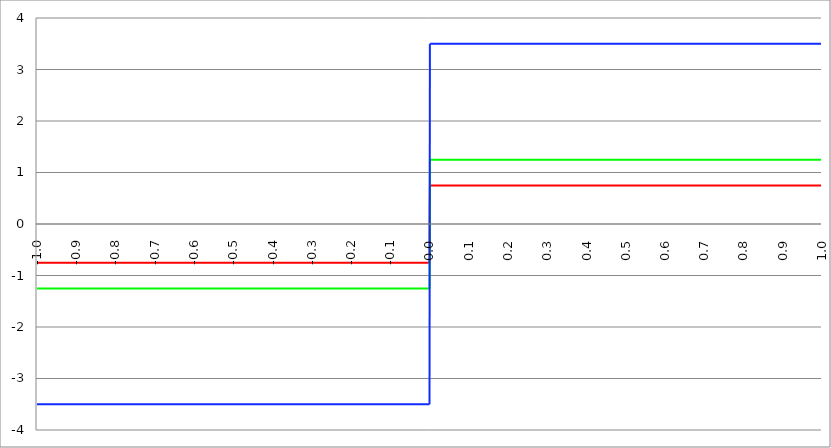
| Category | Series 1 | Series 0 | Series 2 |
|---|---|---|---|
| -1.0 | -0.75 | -1.25 | -3.5 |
| -0.999 | -0.75 | -1.25 | -3.5 |
| -0.998 | -0.75 | -1.25 | -3.5 |
| -0.997 | -0.75 | -1.25 | -3.5 |
| -0.996 | -0.75 | -1.25 | -3.5 |
| -0.995 | -0.75 | -1.25 | -3.5 |
| -0.994 | -0.75 | -1.25 | -3.5 |
| -0.993 | -0.75 | -1.25 | -3.5 |
| -0.992 | -0.75 | -1.25 | -3.5 |
| -0.991 | -0.75 | -1.25 | -3.5 |
| -0.99 | -0.75 | -1.25 | -3.5 |
| -0.989 | -0.75 | -1.25 | -3.5 |
| -0.988 | -0.75 | -1.25 | -3.5 |
| -0.987 | -0.75 | -1.25 | -3.5 |
| -0.986 | -0.75 | -1.25 | -3.5 |
| -0.985 | -0.75 | -1.25 | -3.5 |
| -0.984 | -0.75 | -1.25 | -3.5 |
| -0.983 | -0.75 | -1.25 | -3.5 |
| -0.982 | -0.75 | -1.25 | -3.5 |
| -0.981 | -0.75 | -1.25 | -3.5 |
| -0.98 | -0.75 | -1.25 | -3.5 |
| -0.979 | -0.75 | -1.25 | -3.5 |
| -0.978 | -0.75 | -1.25 | -3.5 |
| -0.977 | -0.75 | -1.25 | -3.5 |
| -0.976 | -0.75 | -1.25 | -3.5 |
| -0.975 | -0.75 | -1.25 | -3.5 |
| -0.974 | -0.75 | -1.25 | -3.5 |
| -0.973 | -0.75 | -1.25 | -3.5 |
| -0.972 | -0.75 | -1.25 | -3.5 |
| -0.971 | -0.75 | -1.25 | -3.5 |
| -0.97 | -0.75 | -1.25 | -3.5 |
| -0.969 | -0.75 | -1.25 | -3.5 |
| -0.968 | -0.75 | -1.25 | -3.5 |
| -0.967 | -0.75 | -1.25 | -3.5 |
| -0.966 | -0.75 | -1.25 | -3.5 |
| -0.965 | -0.75 | -1.25 | -3.5 |
| -0.964 | -0.75 | -1.25 | -3.5 |
| -0.963 | -0.75 | -1.25 | -3.5 |
| -0.962 | -0.75 | -1.25 | -3.5 |
| -0.961 | -0.75 | -1.25 | -3.5 |
| -0.96 | -0.75 | -1.25 | -3.5 |
| -0.959 | -0.75 | -1.25 | -3.5 |
| -0.958 | -0.75 | -1.25 | -3.5 |
| -0.957 | -0.75 | -1.25 | -3.5 |
| -0.956 | -0.75 | -1.25 | -3.5 |
| -0.955 | -0.75 | -1.25 | -3.5 |
| -0.954 | -0.75 | -1.25 | -3.5 |
| -0.953 | -0.75 | -1.25 | -3.5 |
| -0.952 | -0.75 | -1.25 | -3.5 |
| -0.951 | -0.75 | -1.25 | -3.5 |
| -0.95 | -0.75 | -1.25 | -3.5 |
| -0.949 | -0.75 | -1.25 | -3.5 |
| -0.948 | -0.75 | -1.25 | -3.5 |
| -0.947 | -0.75 | -1.25 | -3.5 |
| -0.946 | -0.75 | -1.25 | -3.5 |
| -0.945 | -0.75 | -1.25 | -3.5 |
| -0.944 | -0.75 | -1.25 | -3.5 |
| -0.943 | -0.75 | -1.25 | -3.5 |
| -0.942 | -0.75 | -1.25 | -3.5 |
| -0.941 | -0.75 | -1.25 | -3.5 |
| -0.94 | -0.75 | -1.25 | -3.5 |
| -0.939 | -0.75 | -1.25 | -3.5 |
| -0.938 | -0.75 | -1.25 | -3.5 |
| -0.937 | -0.75 | -1.25 | -3.5 |
| -0.936 | -0.75 | -1.25 | -3.5 |
| -0.935 | -0.75 | -1.25 | -3.5 |
| -0.934 | -0.75 | -1.25 | -3.5 |
| -0.933 | -0.75 | -1.25 | -3.5 |
| -0.932 | -0.75 | -1.25 | -3.5 |
| -0.931 | -0.75 | -1.25 | -3.5 |
| -0.93 | -0.75 | -1.25 | -3.5 |
| -0.929 | -0.75 | -1.25 | -3.5 |
| -0.928 | -0.75 | -1.25 | -3.5 |
| -0.927 | -0.75 | -1.25 | -3.5 |
| -0.926 | -0.75 | -1.25 | -3.5 |
| -0.925 | -0.75 | -1.25 | -3.5 |
| -0.924 | -0.75 | -1.25 | -3.5 |
| -0.923 | -0.75 | -1.25 | -3.5 |
| -0.922 | -0.75 | -1.25 | -3.5 |
| -0.921 | -0.75 | -1.25 | -3.5 |
| -0.92 | -0.75 | -1.25 | -3.5 |
| -0.919 | -0.75 | -1.25 | -3.5 |
| -0.918 | -0.75 | -1.25 | -3.5 |
| -0.917 | -0.75 | -1.25 | -3.5 |
| -0.916 | -0.75 | -1.25 | -3.5 |
| -0.915 | -0.75 | -1.25 | -3.5 |
| -0.914 | -0.75 | -1.25 | -3.5 |
| -0.913 | -0.75 | -1.25 | -3.5 |
| -0.912 | -0.75 | -1.25 | -3.5 |
| -0.911 | -0.75 | -1.25 | -3.5 |
| -0.91 | -0.75 | -1.25 | -3.5 |
| -0.909 | -0.75 | -1.25 | -3.5 |
| -0.908 | -0.75 | -1.25 | -3.5 |
| -0.907 | -0.75 | -1.25 | -3.5 |
| -0.906 | -0.75 | -1.25 | -3.5 |
| -0.905 | -0.75 | -1.25 | -3.5 |
| -0.904 | -0.75 | -1.25 | -3.5 |
| -0.903 | -0.75 | -1.25 | -3.5 |
| -0.902 | -0.75 | -1.25 | -3.5 |
| -0.901 | -0.75 | -1.25 | -3.5 |
| -0.9 | -0.75 | -1.25 | -3.5 |
| -0.899 | -0.75 | -1.25 | -3.5 |
| -0.898 | -0.75 | -1.25 | -3.5 |
| -0.897 | -0.75 | -1.25 | -3.5 |
| -0.896 | -0.75 | -1.25 | -3.5 |
| -0.895 | -0.75 | -1.25 | -3.5 |
| -0.894 | -0.75 | -1.25 | -3.5 |
| -0.893 | -0.75 | -1.25 | -3.5 |
| -0.892 | -0.75 | -1.25 | -3.5 |
| -0.891 | -0.75 | -1.25 | -3.5 |
| -0.89 | -0.75 | -1.25 | -3.5 |
| -0.889 | -0.75 | -1.25 | -3.5 |
| -0.888 | -0.75 | -1.25 | -3.5 |
| -0.887 | -0.75 | -1.25 | -3.5 |
| -0.886 | -0.75 | -1.25 | -3.5 |
| -0.885 | -0.75 | -1.25 | -3.5 |
| -0.884 | -0.75 | -1.25 | -3.5 |
| -0.883 | -0.75 | -1.25 | -3.5 |
| -0.882 | -0.75 | -1.25 | -3.5 |
| -0.881 | -0.75 | -1.25 | -3.5 |
| -0.88 | -0.75 | -1.25 | -3.5 |
| -0.879 | -0.75 | -1.25 | -3.5 |
| -0.878 | -0.75 | -1.25 | -3.5 |
| -0.877 | -0.75 | -1.25 | -3.5 |
| -0.876 | -0.75 | -1.25 | -3.5 |
| -0.875 | -0.75 | -1.25 | -3.5 |
| -0.874 | -0.75 | -1.25 | -3.5 |
| -0.873 | -0.75 | -1.25 | -3.5 |
| -0.872 | -0.75 | -1.25 | -3.5 |
| -0.871 | -0.75 | -1.25 | -3.5 |
| -0.87 | -0.75 | -1.25 | -3.5 |
| -0.869 | -0.75 | -1.25 | -3.5 |
| -0.868 | -0.75 | -1.25 | -3.5 |
| -0.867 | -0.75 | -1.25 | -3.5 |
| -0.866 | -0.75 | -1.25 | -3.5 |
| -0.865 | -0.75 | -1.25 | -3.5 |
| -0.864 | -0.75 | -1.25 | -3.5 |
| -0.863 | -0.75 | -1.25 | -3.5 |
| -0.862 | -0.75 | -1.25 | -3.5 |
| -0.861 | -0.75 | -1.25 | -3.5 |
| -0.86 | -0.75 | -1.25 | -3.5 |
| -0.859 | -0.75 | -1.25 | -3.5 |
| -0.858 | -0.75 | -1.25 | -3.5 |
| -0.857 | -0.75 | -1.25 | -3.5 |
| -0.856 | -0.75 | -1.25 | -3.5 |
| -0.855 | -0.75 | -1.25 | -3.5 |
| -0.854 | -0.75 | -1.25 | -3.5 |
| -0.853 | -0.75 | -1.25 | -3.5 |
| -0.852 | -0.75 | -1.25 | -3.5 |
| -0.851 | -0.75 | -1.25 | -3.5 |
| -0.85 | -0.75 | -1.25 | -3.5 |
| -0.849 | -0.75 | -1.25 | -3.5 |
| -0.848 | -0.75 | -1.25 | -3.5 |
| -0.847 | -0.75 | -1.25 | -3.5 |
| -0.846 | -0.75 | -1.25 | -3.5 |
| -0.845 | -0.75 | -1.25 | -3.5 |
| -0.844 | -0.75 | -1.25 | -3.5 |
| -0.843 | -0.75 | -1.25 | -3.5 |
| -0.842 | -0.75 | -1.25 | -3.5 |
| -0.841 | -0.75 | -1.25 | -3.5 |
| -0.84 | -0.75 | -1.25 | -3.5 |
| -0.839 | -0.75 | -1.25 | -3.5 |
| -0.838 | -0.75 | -1.25 | -3.5 |
| -0.837 | -0.75 | -1.25 | -3.5 |
| -0.836 | -0.75 | -1.25 | -3.5 |
| -0.835 | -0.75 | -1.25 | -3.5 |
| -0.834 | -0.75 | -1.25 | -3.5 |
| -0.833 | -0.75 | -1.25 | -3.5 |
| -0.832 | -0.75 | -1.25 | -3.5 |
| -0.831 | -0.75 | -1.25 | -3.5 |
| -0.83 | -0.75 | -1.25 | -3.5 |
| -0.829 | -0.75 | -1.25 | -3.5 |
| -0.828 | -0.75 | -1.25 | -3.5 |
| -0.827 | -0.75 | -1.25 | -3.5 |
| -0.826 | -0.75 | -1.25 | -3.5 |
| -0.825 | -0.75 | -1.25 | -3.5 |
| -0.824 | -0.75 | -1.25 | -3.5 |
| -0.823 | -0.75 | -1.25 | -3.5 |
| -0.822 | -0.75 | -1.25 | -3.5 |
| -0.821 | -0.75 | -1.25 | -3.5 |
| -0.82 | -0.75 | -1.25 | -3.5 |
| -0.819 | -0.75 | -1.25 | -3.5 |
| -0.818 | -0.75 | -1.25 | -3.5 |
| -0.817 | -0.75 | -1.25 | -3.5 |
| -0.816 | -0.75 | -1.25 | -3.5 |
| -0.815 | -0.75 | -1.25 | -3.5 |
| -0.814 | -0.75 | -1.25 | -3.5 |
| -0.813 | -0.75 | -1.25 | -3.5 |
| -0.812 | -0.75 | -1.25 | -3.5 |
| -0.811 | -0.75 | -1.25 | -3.5 |
| -0.81 | -0.75 | -1.25 | -3.5 |
| -0.809 | -0.75 | -1.25 | -3.5 |
| -0.808 | -0.75 | -1.25 | -3.5 |
| -0.807 | -0.75 | -1.25 | -3.5 |
| -0.806 | -0.75 | -1.25 | -3.5 |
| -0.805 | -0.75 | -1.25 | -3.5 |
| -0.804 | -0.75 | -1.25 | -3.5 |
| -0.803 | -0.75 | -1.25 | -3.5 |
| -0.802 | -0.75 | -1.25 | -3.5 |
| -0.801 | -0.75 | -1.25 | -3.5 |
| -0.8 | -0.75 | -1.25 | -3.5 |
| -0.799 | -0.75 | -1.25 | -3.5 |
| -0.798 | -0.75 | -1.25 | -3.5 |
| -0.797 | -0.75 | -1.25 | -3.5 |
| -0.796 | -0.75 | -1.25 | -3.5 |
| -0.795 | -0.75 | -1.25 | -3.5 |
| -0.794 | -0.75 | -1.25 | -3.5 |
| -0.793 | -0.75 | -1.25 | -3.5 |
| -0.792 | -0.75 | -1.25 | -3.5 |
| -0.791 | -0.75 | -1.25 | -3.5 |
| -0.79 | -0.75 | -1.25 | -3.5 |
| -0.789 | -0.75 | -1.25 | -3.5 |
| -0.788 | -0.75 | -1.25 | -3.5 |
| -0.787 | -0.75 | -1.25 | -3.5 |
| -0.786 | -0.75 | -1.25 | -3.5 |
| -0.785 | -0.75 | -1.25 | -3.5 |
| -0.784 | -0.75 | -1.25 | -3.5 |
| -0.783 | -0.75 | -1.25 | -3.5 |
| -0.782 | -0.75 | -1.25 | -3.5 |
| -0.781 | -0.75 | -1.25 | -3.5 |
| -0.78 | -0.75 | -1.25 | -3.5 |
| -0.779 | -0.75 | -1.25 | -3.5 |
| -0.778 | -0.75 | -1.25 | -3.5 |
| -0.777 | -0.75 | -1.25 | -3.5 |
| -0.776 | -0.75 | -1.25 | -3.5 |
| -0.775 | -0.75 | -1.25 | -3.5 |
| -0.774 | -0.75 | -1.25 | -3.5 |
| -0.773 | -0.75 | -1.25 | -3.5 |
| -0.772 | -0.75 | -1.25 | -3.5 |
| -0.771 | -0.75 | -1.25 | -3.5 |
| -0.77 | -0.75 | -1.25 | -3.5 |
| -0.769 | -0.75 | -1.25 | -3.5 |
| -0.768 | -0.75 | -1.25 | -3.5 |
| -0.767 | -0.75 | -1.25 | -3.5 |
| -0.766 | -0.75 | -1.25 | -3.5 |
| -0.765 | -0.75 | -1.25 | -3.5 |
| -0.764 | -0.75 | -1.25 | -3.5 |
| -0.763 | -0.75 | -1.25 | -3.5 |
| -0.762 | -0.75 | -1.25 | -3.5 |
| -0.761 | -0.75 | -1.25 | -3.5 |
| -0.76 | -0.75 | -1.25 | -3.5 |
| -0.759 | -0.75 | -1.25 | -3.5 |
| -0.758 | -0.75 | -1.25 | -3.5 |
| -0.757 | -0.75 | -1.25 | -3.5 |
| -0.756 | -0.75 | -1.25 | -3.5 |
| -0.755 | -0.75 | -1.25 | -3.5 |
| -0.754 | -0.75 | -1.25 | -3.5 |
| -0.753 | -0.75 | -1.25 | -3.5 |
| -0.752 | -0.75 | -1.25 | -3.5 |
| -0.751 | -0.75 | -1.25 | -3.5 |
| -0.75 | -0.75 | -1.25 | -3.5 |
| -0.749 | -0.75 | -1.25 | -3.5 |
| -0.748 | -0.75 | -1.25 | -3.5 |
| -0.747 | -0.75 | -1.25 | -3.5 |
| -0.746 | -0.75 | -1.25 | -3.5 |
| -0.745 | -0.75 | -1.25 | -3.5 |
| -0.744 | -0.75 | -1.25 | -3.5 |
| -0.743 | -0.75 | -1.25 | -3.5 |
| -0.742 | -0.75 | -1.25 | -3.5 |
| -0.741 | -0.75 | -1.25 | -3.5 |
| -0.74 | -0.75 | -1.25 | -3.5 |
| -0.739 | -0.75 | -1.25 | -3.5 |
| -0.738 | -0.75 | -1.25 | -3.5 |
| -0.737 | -0.75 | -1.25 | -3.5 |
| -0.736 | -0.75 | -1.25 | -3.5 |
| -0.735 | -0.75 | -1.25 | -3.5 |
| -0.734 | -0.75 | -1.25 | -3.5 |
| -0.733 | -0.75 | -1.25 | -3.5 |
| -0.732 | -0.75 | -1.25 | -3.5 |
| -0.731 | -0.75 | -1.25 | -3.5 |
| -0.73 | -0.75 | -1.25 | -3.5 |
| -0.729 | -0.75 | -1.25 | -3.5 |
| -0.728 | -0.75 | -1.25 | -3.5 |
| -0.727 | -0.75 | -1.25 | -3.5 |
| -0.726 | -0.75 | -1.25 | -3.5 |
| -0.725 | -0.75 | -1.25 | -3.5 |
| -0.724 | -0.75 | -1.25 | -3.5 |
| -0.723 | -0.75 | -1.25 | -3.5 |
| -0.722 | -0.75 | -1.25 | -3.5 |
| -0.721 | -0.75 | -1.25 | -3.5 |
| -0.72 | -0.75 | -1.25 | -3.5 |
| -0.719 | -0.75 | -1.25 | -3.5 |
| -0.718 | -0.75 | -1.25 | -3.5 |
| -0.717 | -0.75 | -1.25 | -3.5 |
| -0.716 | -0.75 | -1.25 | -3.5 |
| -0.715 | -0.75 | -1.25 | -3.5 |
| -0.714 | -0.75 | -1.25 | -3.5 |
| -0.713 | -0.75 | -1.25 | -3.5 |
| -0.712 | -0.75 | -1.25 | -3.5 |
| -0.711 | -0.75 | -1.25 | -3.5 |
| -0.71 | -0.75 | -1.25 | -3.5 |
| -0.709 | -0.75 | -1.25 | -3.5 |
| -0.708 | -0.75 | -1.25 | -3.5 |
| -0.707 | -0.75 | -1.25 | -3.5 |
| -0.706 | -0.75 | -1.25 | -3.5 |
| -0.705 | -0.75 | -1.25 | -3.5 |
| -0.704 | -0.75 | -1.25 | -3.5 |
| -0.703 | -0.75 | -1.25 | -3.5 |
| -0.702 | -0.75 | -1.25 | -3.5 |
| -0.701 | -0.75 | -1.25 | -3.5 |
| -0.7 | -0.75 | -1.25 | -3.5 |
| -0.699 | -0.75 | -1.25 | -3.5 |
| -0.698 | -0.75 | -1.25 | -3.5 |
| -0.697 | -0.75 | -1.25 | -3.5 |
| -0.696 | -0.75 | -1.25 | -3.5 |
| -0.695 | -0.75 | -1.25 | -3.5 |
| -0.694 | -0.75 | -1.25 | -3.5 |
| -0.693 | -0.75 | -1.25 | -3.5 |
| -0.692 | -0.75 | -1.25 | -3.5 |
| -0.691 | -0.75 | -1.25 | -3.5 |
| -0.69 | -0.75 | -1.25 | -3.5 |
| -0.689 | -0.75 | -1.25 | -3.5 |
| -0.688 | -0.75 | -1.25 | -3.5 |
| -0.687 | -0.75 | -1.25 | -3.5 |
| -0.686 | -0.75 | -1.25 | -3.5 |
| -0.685 | -0.75 | -1.25 | -3.5 |
| -0.684 | -0.75 | -1.25 | -3.5 |
| -0.683 | -0.75 | -1.25 | -3.5 |
| -0.682 | -0.75 | -1.25 | -3.5 |
| -0.681 | -0.75 | -1.25 | -3.5 |
| -0.68 | -0.75 | -1.25 | -3.5 |
| -0.679 | -0.75 | -1.25 | -3.5 |
| -0.678 | -0.75 | -1.25 | -3.5 |
| -0.677 | -0.75 | -1.25 | -3.5 |
| -0.676 | -0.75 | -1.25 | -3.5 |
| -0.675 | -0.75 | -1.25 | -3.5 |
| -0.674 | -0.75 | -1.25 | -3.5 |
| -0.673 | -0.75 | -1.25 | -3.5 |
| -0.672 | -0.75 | -1.25 | -3.5 |
| -0.671 | -0.75 | -1.25 | -3.5 |
| -0.67 | -0.75 | -1.25 | -3.5 |
| -0.669 | -0.75 | -1.25 | -3.5 |
| -0.668 | -0.75 | -1.25 | -3.5 |
| -0.667 | -0.75 | -1.25 | -3.5 |
| -0.666 | -0.75 | -1.25 | -3.5 |
| -0.665 | -0.75 | -1.25 | -3.5 |
| -0.664 | -0.75 | -1.25 | -3.5 |
| -0.663 | -0.75 | -1.25 | -3.5 |
| -0.662 | -0.75 | -1.25 | -3.5 |
| -0.661 | -0.75 | -1.25 | -3.5 |
| -0.66 | -0.75 | -1.25 | -3.5 |
| -0.659 | -0.75 | -1.25 | -3.5 |
| -0.658 | -0.75 | -1.25 | -3.5 |
| -0.657 | -0.75 | -1.25 | -3.5 |
| -0.656 | -0.75 | -1.25 | -3.5 |
| -0.655 | -0.75 | -1.25 | -3.5 |
| -0.654 | -0.75 | -1.25 | -3.5 |
| -0.653 | -0.75 | -1.25 | -3.5 |
| -0.652 | -0.75 | -1.25 | -3.5 |
| -0.651 | -0.75 | -1.25 | -3.5 |
| -0.65 | -0.75 | -1.25 | -3.5 |
| -0.649 | -0.75 | -1.25 | -3.5 |
| -0.648 | -0.75 | -1.25 | -3.5 |
| -0.647 | -0.75 | -1.25 | -3.5 |
| -0.646 | -0.75 | -1.25 | -3.5 |
| -0.645 | -0.75 | -1.25 | -3.5 |
| -0.644 | -0.75 | -1.25 | -3.5 |
| -0.643 | -0.75 | -1.25 | -3.5 |
| -0.642 | -0.75 | -1.25 | -3.5 |
| -0.641 | -0.75 | -1.25 | -3.5 |
| -0.64 | -0.75 | -1.25 | -3.5 |
| -0.639 | -0.75 | -1.25 | -3.5 |
| -0.638 | -0.75 | -1.25 | -3.5 |
| -0.637 | -0.75 | -1.25 | -3.5 |
| -0.636 | -0.75 | -1.25 | -3.5 |
| -0.635 | -0.75 | -1.25 | -3.5 |
| -0.634 | -0.75 | -1.25 | -3.5 |
| -0.633 | -0.75 | -1.25 | -3.5 |
| -0.632 | -0.75 | -1.25 | -3.5 |
| -0.631 | -0.75 | -1.25 | -3.5 |
| -0.63 | -0.75 | -1.25 | -3.5 |
| -0.629 | -0.75 | -1.25 | -3.5 |
| -0.628 | -0.75 | -1.25 | -3.5 |
| -0.627 | -0.75 | -1.25 | -3.5 |
| -0.626 | -0.75 | -1.25 | -3.5 |
| -0.625 | -0.75 | -1.25 | -3.5 |
| -0.624 | -0.75 | -1.25 | -3.5 |
| -0.623 | -0.75 | -1.25 | -3.5 |
| -0.622 | -0.75 | -1.25 | -3.5 |
| -0.621 | -0.75 | -1.25 | -3.5 |
| -0.62 | -0.75 | -1.25 | -3.5 |
| -0.619 | -0.75 | -1.25 | -3.5 |
| -0.618 | -0.75 | -1.25 | -3.5 |
| -0.617 | -0.75 | -1.25 | -3.5 |
| -0.616 | -0.75 | -1.25 | -3.5 |
| -0.615 | -0.75 | -1.25 | -3.5 |
| -0.614 | -0.75 | -1.25 | -3.5 |
| -0.613 | -0.75 | -1.25 | -3.5 |
| -0.612 | -0.75 | -1.25 | -3.5 |
| -0.611 | -0.75 | -1.25 | -3.5 |
| -0.61 | -0.75 | -1.25 | -3.5 |
| -0.609 | -0.75 | -1.25 | -3.5 |
| -0.608 | -0.75 | -1.25 | -3.5 |
| -0.607 | -0.75 | -1.25 | -3.5 |
| -0.606 | -0.75 | -1.25 | -3.5 |
| -0.605 | -0.75 | -1.25 | -3.5 |
| -0.604 | -0.75 | -1.25 | -3.5 |
| -0.603 | -0.75 | -1.25 | -3.5 |
| -0.602 | -0.75 | -1.25 | -3.5 |
| -0.601 | -0.75 | -1.25 | -3.5 |
| -0.6 | -0.75 | -1.25 | -3.5 |
| -0.599 | -0.75 | -1.25 | -3.5 |
| -0.598 | -0.75 | -1.25 | -3.5 |
| -0.597 | -0.75 | -1.25 | -3.5 |
| -0.596 | -0.75 | -1.25 | -3.5 |
| -0.595 | -0.75 | -1.25 | -3.5 |
| -0.594 | -0.75 | -1.25 | -3.5 |
| -0.593 | -0.75 | -1.25 | -3.5 |
| -0.592 | -0.75 | -1.25 | -3.5 |
| -0.591 | -0.75 | -1.25 | -3.5 |
| -0.59 | -0.75 | -1.25 | -3.5 |
| -0.589 | -0.75 | -1.25 | -3.5 |
| -0.588 | -0.75 | -1.25 | -3.5 |
| -0.587 | -0.75 | -1.25 | -3.5 |
| -0.586 | -0.75 | -1.25 | -3.5 |
| -0.585 | -0.75 | -1.25 | -3.5 |
| -0.584 | -0.75 | -1.25 | -3.5 |
| -0.583 | -0.75 | -1.25 | -3.5 |
| -0.582 | -0.75 | -1.25 | -3.5 |
| -0.581 | -0.75 | -1.25 | -3.5 |
| -0.58 | -0.75 | -1.25 | -3.5 |
| -0.579 | -0.75 | -1.25 | -3.5 |
| -0.578 | -0.75 | -1.25 | -3.5 |
| -0.577 | -0.75 | -1.25 | -3.5 |
| -0.576 | -0.75 | -1.25 | -3.5 |
| -0.575 | -0.75 | -1.25 | -3.5 |
| -0.574 | -0.75 | -1.25 | -3.5 |
| -0.573 | -0.75 | -1.25 | -3.5 |
| -0.572 | -0.75 | -1.25 | -3.5 |
| -0.571 | -0.75 | -1.25 | -3.5 |
| -0.57 | -0.75 | -1.25 | -3.5 |
| -0.569 | -0.75 | -1.25 | -3.5 |
| -0.568 | -0.75 | -1.25 | -3.5 |
| -0.567 | -0.75 | -1.25 | -3.5 |
| -0.566 | -0.75 | -1.25 | -3.5 |
| -0.565 | -0.75 | -1.25 | -3.5 |
| -0.564 | -0.75 | -1.25 | -3.5 |
| -0.563 | -0.75 | -1.25 | -3.5 |
| -0.562 | -0.75 | -1.25 | -3.5 |
| -0.561 | -0.75 | -1.25 | -3.5 |
| -0.56 | -0.75 | -1.25 | -3.5 |
| -0.559 | -0.75 | -1.25 | -3.5 |
| -0.558 | -0.75 | -1.25 | -3.5 |
| -0.557 | -0.75 | -1.25 | -3.5 |
| -0.556 | -0.75 | -1.25 | -3.5 |
| -0.555 | -0.75 | -1.25 | -3.5 |
| -0.554 | -0.75 | -1.25 | -3.5 |
| -0.553 | -0.75 | -1.25 | -3.5 |
| -0.552 | -0.75 | -1.25 | -3.5 |
| -0.551 | -0.75 | -1.25 | -3.5 |
| -0.55 | -0.75 | -1.25 | -3.5 |
| -0.549 | -0.75 | -1.25 | -3.5 |
| -0.548 | -0.75 | -1.25 | -3.5 |
| -0.547 | -0.75 | -1.25 | -3.5 |
| -0.546 | -0.75 | -1.25 | -3.5 |
| -0.545 | -0.75 | -1.25 | -3.5 |
| -0.544 | -0.75 | -1.25 | -3.5 |
| -0.543 | -0.75 | -1.25 | -3.5 |
| -0.542 | -0.75 | -1.25 | -3.5 |
| -0.541 | -0.75 | -1.25 | -3.5 |
| -0.54 | -0.75 | -1.25 | -3.5 |
| -0.539 | -0.75 | -1.25 | -3.5 |
| -0.538 | -0.75 | -1.25 | -3.5 |
| -0.537 | -0.75 | -1.25 | -3.5 |
| -0.536 | -0.75 | -1.25 | -3.5 |
| -0.535 | -0.75 | -1.25 | -3.5 |
| -0.534 | -0.75 | -1.25 | -3.5 |
| -0.533 | -0.75 | -1.25 | -3.5 |
| -0.532 | -0.75 | -1.25 | -3.5 |
| -0.531 | -0.75 | -1.25 | -3.5 |
| -0.53 | -0.75 | -1.25 | -3.5 |
| -0.529 | -0.75 | -1.25 | -3.5 |
| -0.528 | -0.75 | -1.25 | -3.5 |
| -0.527 | -0.75 | -1.25 | -3.5 |
| -0.526 | -0.75 | -1.25 | -3.5 |
| -0.525 | -0.75 | -1.25 | -3.5 |
| -0.524 | -0.75 | -1.25 | -3.5 |
| -0.523 | -0.75 | -1.25 | -3.5 |
| -0.522 | -0.75 | -1.25 | -3.5 |
| -0.521 | -0.75 | -1.25 | -3.5 |
| -0.52 | -0.75 | -1.25 | -3.5 |
| -0.519 | -0.75 | -1.25 | -3.5 |
| -0.518 | -0.75 | -1.25 | -3.5 |
| -0.517 | -0.75 | -1.25 | -3.5 |
| -0.516 | -0.75 | -1.25 | -3.5 |
| -0.515 | -0.75 | -1.25 | -3.5 |
| -0.514 | -0.75 | -1.25 | -3.5 |
| -0.513 | -0.75 | -1.25 | -3.5 |
| -0.512 | -0.75 | -1.25 | -3.5 |
| -0.511 | -0.75 | -1.25 | -3.5 |
| -0.51 | -0.75 | -1.25 | -3.5 |
| -0.509 | -0.75 | -1.25 | -3.5 |
| -0.508 | -0.75 | -1.25 | -3.5 |
| -0.507 | -0.75 | -1.25 | -3.5 |
| -0.506 | -0.75 | -1.25 | -3.5 |
| -0.505 | -0.75 | -1.25 | -3.5 |
| -0.504 | -0.75 | -1.25 | -3.5 |
| -0.503 | -0.75 | -1.25 | -3.5 |
| -0.502 | -0.75 | -1.25 | -3.5 |
| -0.501 | -0.75 | -1.25 | -3.5 |
| -0.5 | -0.75 | -1.25 | -3.5 |
| -0.499 | -0.75 | -1.25 | -3.5 |
| -0.498 | -0.75 | -1.25 | -3.5 |
| -0.497 | -0.75 | -1.25 | -3.5 |
| -0.496 | -0.75 | -1.25 | -3.5 |
| -0.495 | -0.75 | -1.25 | -3.5 |
| -0.494 | -0.75 | -1.25 | -3.5 |
| -0.493 | -0.75 | -1.25 | -3.5 |
| -0.492 | -0.75 | -1.25 | -3.5 |
| -0.491 | -0.75 | -1.25 | -3.5 |
| -0.49 | -0.75 | -1.25 | -3.5 |
| -0.489 | -0.75 | -1.25 | -3.5 |
| -0.488 | -0.75 | -1.25 | -3.5 |
| -0.487 | -0.75 | -1.25 | -3.5 |
| -0.486 | -0.75 | -1.25 | -3.5 |
| -0.485 | -0.75 | -1.25 | -3.5 |
| -0.484 | -0.75 | -1.25 | -3.5 |
| -0.483 | -0.75 | -1.25 | -3.5 |
| -0.482 | -0.75 | -1.25 | -3.5 |
| -0.481 | -0.75 | -1.25 | -3.5 |
| -0.48 | -0.75 | -1.25 | -3.5 |
| -0.479 | -0.75 | -1.25 | -3.5 |
| -0.478 | -0.75 | -1.25 | -3.5 |
| -0.477 | -0.75 | -1.25 | -3.5 |
| -0.476 | -0.75 | -1.25 | -3.5 |
| -0.475 | -0.75 | -1.25 | -3.5 |
| -0.474 | -0.75 | -1.25 | -3.5 |
| -0.473 | -0.75 | -1.25 | -3.5 |
| -0.472 | -0.75 | -1.25 | -3.5 |
| -0.471 | -0.75 | -1.25 | -3.5 |
| -0.469999999999999 | -0.75 | -1.25 | -3.5 |
| -0.468999999999999 | -0.75 | -1.25 | -3.5 |
| -0.467999999999999 | -0.75 | -1.25 | -3.5 |
| -0.466999999999999 | -0.75 | -1.25 | -3.5 |
| -0.465999999999999 | -0.75 | -1.25 | -3.5 |
| -0.464999999999999 | -0.75 | -1.25 | -3.5 |
| -0.463999999999999 | -0.75 | -1.25 | -3.5 |
| -0.462999999999999 | -0.75 | -1.25 | -3.5 |
| -0.461999999999999 | -0.75 | -1.25 | -3.5 |
| -0.460999999999999 | -0.75 | -1.25 | -3.5 |
| -0.459999999999999 | -0.75 | -1.25 | -3.5 |
| -0.458999999999999 | -0.75 | -1.25 | -3.5 |
| -0.457999999999999 | -0.75 | -1.25 | -3.5 |
| -0.456999999999999 | -0.75 | -1.25 | -3.5 |
| -0.455999999999999 | -0.75 | -1.25 | -3.5 |
| -0.454999999999999 | -0.75 | -1.25 | -3.5 |
| -0.453999999999999 | -0.75 | -1.25 | -3.5 |
| -0.452999999999999 | -0.75 | -1.25 | -3.5 |
| -0.451999999999999 | -0.75 | -1.25 | -3.5 |
| -0.450999999999999 | -0.75 | -1.25 | -3.5 |
| -0.449999999999999 | -0.75 | -1.25 | -3.5 |
| -0.448999999999999 | -0.75 | -1.25 | -3.5 |
| -0.447999999999999 | -0.75 | -1.25 | -3.5 |
| -0.446999999999999 | -0.75 | -1.25 | -3.5 |
| -0.445999999999999 | -0.75 | -1.25 | -3.5 |
| -0.444999999999999 | -0.75 | -1.25 | -3.5 |
| -0.443999999999999 | -0.75 | -1.25 | -3.5 |
| -0.442999999999999 | -0.75 | -1.25 | -3.5 |
| -0.441999999999999 | -0.75 | -1.25 | -3.5 |
| -0.440999999999999 | -0.75 | -1.25 | -3.5 |
| -0.439999999999999 | -0.75 | -1.25 | -3.5 |
| -0.438999999999999 | -0.75 | -1.25 | -3.5 |
| -0.437999999999999 | -0.75 | -1.25 | -3.5 |
| -0.436999999999999 | -0.75 | -1.25 | -3.5 |
| -0.435999999999999 | -0.75 | -1.25 | -3.5 |
| -0.434999999999999 | -0.75 | -1.25 | -3.5 |
| -0.433999999999999 | -0.75 | -1.25 | -3.5 |
| -0.432999999999999 | -0.75 | -1.25 | -3.5 |
| -0.431999999999999 | -0.75 | -1.25 | -3.5 |
| -0.430999999999999 | -0.75 | -1.25 | -3.5 |
| -0.429999999999999 | -0.75 | -1.25 | -3.5 |
| -0.428999999999999 | -0.75 | -1.25 | -3.5 |
| -0.427999999999999 | -0.75 | -1.25 | -3.5 |
| -0.426999999999999 | -0.75 | -1.25 | -3.5 |
| -0.425999999999999 | -0.75 | -1.25 | -3.5 |
| -0.424999999999999 | -0.75 | -1.25 | -3.5 |
| -0.423999999999999 | -0.75 | -1.25 | -3.5 |
| -0.422999999999999 | -0.75 | -1.25 | -3.5 |
| -0.421999999999999 | -0.75 | -1.25 | -3.5 |
| -0.420999999999999 | -0.75 | -1.25 | -3.5 |
| -0.419999999999999 | -0.75 | -1.25 | -3.5 |
| -0.418999999999999 | -0.75 | -1.25 | -3.5 |
| -0.417999999999999 | -0.75 | -1.25 | -3.5 |
| -0.416999999999999 | -0.75 | -1.25 | -3.5 |
| -0.415999999999999 | -0.75 | -1.25 | -3.5 |
| -0.414999999999999 | -0.75 | -1.25 | -3.5 |
| -0.413999999999999 | -0.75 | -1.25 | -3.5 |
| -0.412999999999999 | -0.75 | -1.25 | -3.5 |
| -0.411999999999999 | -0.75 | -1.25 | -3.5 |
| -0.410999999999999 | -0.75 | -1.25 | -3.5 |
| -0.409999999999999 | -0.75 | -1.25 | -3.5 |
| -0.408999999999999 | -0.75 | -1.25 | -3.5 |
| -0.407999999999999 | -0.75 | -1.25 | -3.5 |
| -0.406999999999999 | -0.75 | -1.25 | -3.5 |
| -0.405999999999999 | -0.75 | -1.25 | -3.5 |
| -0.404999999999999 | -0.75 | -1.25 | -3.5 |
| -0.403999999999999 | -0.75 | -1.25 | -3.5 |
| -0.402999999999999 | -0.75 | -1.25 | -3.5 |
| -0.401999999999999 | -0.75 | -1.25 | -3.5 |
| -0.400999999999999 | -0.75 | -1.25 | -3.5 |
| -0.399999999999999 | -0.75 | -1.25 | -3.5 |
| -0.398999999999999 | -0.75 | -1.25 | -3.5 |
| -0.397999999999999 | -0.75 | -1.25 | -3.5 |
| -0.396999999999999 | -0.75 | -1.25 | -3.5 |
| -0.395999999999999 | -0.75 | -1.25 | -3.5 |
| -0.394999999999999 | -0.75 | -1.25 | -3.5 |
| -0.393999999999999 | -0.75 | -1.25 | -3.5 |
| -0.392999999999999 | -0.75 | -1.25 | -3.5 |
| -0.391999999999999 | -0.75 | -1.25 | -3.5 |
| -0.390999999999999 | -0.75 | -1.25 | -3.5 |
| -0.389999999999999 | -0.75 | -1.25 | -3.5 |
| -0.388999999999999 | -0.75 | -1.25 | -3.5 |
| -0.387999999999999 | -0.75 | -1.25 | -3.5 |
| -0.386999999999999 | -0.75 | -1.25 | -3.5 |
| -0.385999999999999 | -0.75 | -1.25 | -3.5 |
| -0.384999999999999 | -0.75 | -1.25 | -3.5 |
| -0.383999999999999 | -0.75 | -1.25 | -3.5 |
| -0.382999999999999 | -0.75 | -1.25 | -3.5 |
| -0.381999999999999 | -0.75 | -1.25 | -3.5 |
| -0.380999999999999 | -0.75 | -1.25 | -3.5 |
| -0.379999999999999 | -0.75 | -1.25 | -3.5 |
| -0.378999999999999 | -0.75 | -1.25 | -3.5 |
| -0.377999999999999 | -0.75 | -1.25 | -3.5 |
| -0.376999999999999 | -0.75 | -1.25 | -3.5 |
| -0.375999999999999 | -0.75 | -1.25 | -3.5 |
| -0.374999999999999 | -0.75 | -1.25 | -3.5 |
| -0.373999999999999 | -0.75 | -1.25 | -3.5 |
| -0.372999999999999 | -0.75 | -1.25 | -3.5 |
| -0.371999999999999 | -0.75 | -1.25 | -3.5 |
| -0.370999999999999 | -0.75 | -1.25 | -3.5 |
| -0.369999999999999 | -0.75 | -1.25 | -3.5 |
| -0.368999999999999 | -0.75 | -1.25 | -3.5 |
| -0.367999999999999 | -0.75 | -1.25 | -3.5 |
| -0.366999999999999 | -0.75 | -1.25 | -3.5 |
| -0.365999999999999 | -0.75 | -1.25 | -3.5 |
| -0.364999999999999 | -0.75 | -1.25 | -3.5 |
| -0.363999999999999 | -0.75 | -1.25 | -3.5 |
| -0.362999999999999 | -0.75 | -1.25 | -3.5 |
| -0.361999999999999 | -0.75 | -1.25 | -3.5 |
| -0.360999999999999 | -0.75 | -1.25 | -3.5 |
| -0.359999999999999 | -0.75 | -1.25 | -3.5 |
| -0.358999999999999 | -0.75 | -1.25 | -3.5 |
| -0.357999999999999 | -0.75 | -1.25 | -3.5 |
| -0.356999999999999 | -0.75 | -1.25 | -3.5 |
| -0.355999999999999 | -0.75 | -1.25 | -3.5 |
| -0.354999999999999 | -0.75 | -1.25 | -3.5 |
| -0.353999999999999 | -0.75 | -1.25 | -3.5 |
| -0.352999999999999 | -0.75 | -1.25 | -3.5 |
| -0.351999999999999 | -0.75 | -1.25 | -3.5 |
| -0.350999999999999 | -0.75 | -1.25 | -3.5 |
| -0.349999999999999 | -0.75 | -1.25 | -3.5 |
| -0.348999999999999 | -0.75 | -1.25 | -3.5 |
| -0.347999999999999 | -0.75 | -1.25 | -3.5 |
| -0.346999999999999 | -0.75 | -1.25 | -3.5 |
| -0.345999999999999 | -0.75 | -1.25 | -3.5 |
| -0.344999999999999 | -0.75 | -1.25 | -3.5 |
| -0.343999999999999 | -0.75 | -1.25 | -3.5 |
| -0.342999999999999 | -0.75 | -1.25 | -3.5 |
| -0.341999999999999 | -0.75 | -1.25 | -3.5 |
| -0.340999999999999 | -0.75 | -1.25 | -3.5 |
| -0.339999999999999 | -0.75 | -1.25 | -3.5 |
| -0.338999999999999 | -0.75 | -1.25 | -3.5 |
| -0.337999999999999 | -0.75 | -1.25 | -3.5 |
| -0.336999999999999 | -0.75 | -1.25 | -3.5 |
| -0.335999999999999 | -0.75 | -1.25 | -3.5 |
| -0.334999999999999 | -0.75 | -1.25 | -3.5 |
| -0.333999999999999 | -0.75 | -1.25 | -3.5 |
| -0.332999999999999 | -0.75 | -1.25 | -3.5 |
| -0.331999999999999 | -0.75 | -1.25 | -3.5 |
| -0.330999999999999 | -0.75 | -1.25 | -3.5 |
| -0.329999999999999 | -0.75 | -1.25 | -3.5 |
| -0.328999999999999 | -0.75 | -1.25 | -3.5 |
| -0.327999999999999 | -0.75 | -1.25 | -3.5 |
| -0.326999999999999 | -0.75 | -1.25 | -3.5 |
| -0.325999999999999 | -0.75 | -1.25 | -3.5 |
| -0.324999999999999 | -0.75 | -1.25 | -3.5 |
| -0.323999999999999 | -0.75 | -1.25 | -3.5 |
| -0.322999999999999 | -0.75 | -1.25 | -3.5 |
| -0.321999999999999 | -0.75 | -1.25 | -3.5 |
| -0.320999999999999 | -0.75 | -1.25 | -3.5 |
| -0.319999999999999 | -0.75 | -1.25 | -3.5 |
| -0.318999999999999 | -0.75 | -1.25 | -3.5 |
| -0.317999999999999 | -0.75 | -1.25 | -3.5 |
| -0.316999999999999 | -0.75 | -1.25 | -3.5 |
| -0.315999999999999 | -0.75 | -1.25 | -3.5 |
| -0.314999999999999 | -0.75 | -1.25 | -3.5 |
| -0.313999999999999 | -0.75 | -1.25 | -3.5 |
| -0.312999999999999 | -0.75 | -1.25 | -3.5 |
| -0.311999999999999 | -0.75 | -1.25 | -3.5 |
| -0.310999999999999 | -0.75 | -1.25 | -3.5 |
| -0.309999999999999 | -0.75 | -1.25 | -3.5 |
| -0.308999999999999 | -0.75 | -1.25 | -3.5 |
| -0.307999999999999 | -0.75 | -1.25 | -3.5 |
| -0.306999999999999 | -0.75 | -1.25 | -3.5 |
| -0.305999999999999 | -0.75 | -1.25 | -3.5 |
| -0.304999999999999 | -0.75 | -1.25 | -3.5 |
| -0.303999999999999 | -0.75 | -1.25 | -3.5 |
| -0.302999999999999 | -0.75 | -1.25 | -3.5 |
| -0.301999999999999 | -0.75 | -1.25 | -3.5 |
| -0.300999999999999 | -0.75 | -1.25 | -3.5 |
| -0.299999999999999 | -0.75 | -1.25 | -3.5 |
| -0.298999999999999 | -0.75 | -1.25 | -3.5 |
| -0.297999999999999 | -0.75 | -1.25 | -3.5 |
| -0.296999999999999 | -0.75 | -1.25 | -3.5 |
| -0.295999999999999 | -0.75 | -1.25 | -3.5 |
| -0.294999999999999 | -0.75 | -1.25 | -3.5 |
| -0.293999999999999 | -0.75 | -1.25 | -3.5 |
| -0.292999999999999 | -0.75 | -1.25 | -3.5 |
| -0.291999999999999 | -0.75 | -1.25 | -3.5 |
| -0.290999999999999 | -0.75 | -1.25 | -3.5 |
| -0.289999999999999 | -0.75 | -1.25 | -3.5 |
| -0.288999999999999 | -0.75 | -1.25 | -3.5 |
| -0.287999999999999 | -0.75 | -1.25 | -3.5 |
| -0.286999999999999 | -0.75 | -1.25 | -3.5 |
| -0.285999999999999 | -0.75 | -1.25 | -3.5 |
| -0.284999999999999 | -0.75 | -1.25 | -3.5 |
| -0.283999999999999 | -0.75 | -1.25 | -3.5 |
| -0.282999999999999 | -0.75 | -1.25 | -3.5 |
| -0.281999999999999 | -0.75 | -1.25 | -3.5 |
| -0.280999999999999 | -0.75 | -1.25 | -3.5 |
| -0.279999999999999 | -0.75 | -1.25 | -3.5 |
| -0.278999999999999 | -0.75 | -1.25 | -3.5 |
| -0.277999999999999 | -0.75 | -1.25 | -3.5 |
| -0.276999999999999 | -0.75 | -1.25 | -3.5 |
| -0.275999999999999 | -0.75 | -1.25 | -3.5 |
| -0.274999999999999 | -0.75 | -1.25 | -3.5 |
| -0.273999999999999 | -0.75 | -1.25 | -3.5 |
| -0.272999999999999 | -0.75 | -1.25 | -3.5 |
| -0.271999999999999 | -0.75 | -1.25 | -3.5 |
| -0.270999999999999 | -0.75 | -1.25 | -3.5 |
| -0.269999999999999 | -0.75 | -1.25 | -3.5 |
| -0.268999999999999 | -0.75 | -1.25 | -3.5 |
| -0.267999999999999 | -0.75 | -1.25 | -3.5 |
| -0.266999999999999 | -0.75 | -1.25 | -3.5 |
| -0.265999999999999 | -0.75 | -1.25 | -3.5 |
| -0.264999999999999 | -0.75 | -1.25 | -3.5 |
| -0.263999999999999 | -0.75 | -1.25 | -3.5 |
| -0.262999999999999 | -0.75 | -1.25 | -3.5 |
| -0.261999999999999 | -0.75 | -1.25 | -3.5 |
| -0.260999999999999 | -0.75 | -1.25 | -3.5 |
| -0.259999999999999 | -0.75 | -1.25 | -3.5 |
| -0.258999999999999 | -0.75 | -1.25 | -3.5 |
| -0.257999999999999 | -0.75 | -1.25 | -3.5 |
| -0.256999999999999 | -0.75 | -1.25 | -3.5 |
| -0.255999999999999 | -0.75 | -1.25 | -3.5 |
| -0.254999999999999 | -0.75 | -1.25 | -3.5 |
| -0.253999999999999 | -0.75 | -1.25 | -3.5 |
| -0.252999999999999 | -0.75 | -1.25 | -3.5 |
| -0.251999999999999 | -0.75 | -1.25 | -3.5 |
| -0.250999999999999 | -0.75 | -1.25 | -3.5 |
| -0.249999999999999 | -0.75 | -1.25 | -3.5 |
| -0.248999999999999 | -0.75 | -1.25 | -3.5 |
| -0.247999999999999 | -0.75 | -1.25 | -3.5 |
| -0.246999999999999 | -0.75 | -1.25 | -3.5 |
| -0.245999999999999 | -0.75 | -1.25 | -3.5 |
| -0.244999999999999 | -0.75 | -1.25 | -3.5 |
| -0.243999999999999 | -0.75 | -1.25 | -3.5 |
| -0.242999999999999 | -0.75 | -1.25 | -3.5 |
| -0.241999999999999 | -0.75 | -1.25 | -3.5 |
| -0.240999999999999 | -0.75 | -1.25 | -3.5 |
| -0.239999999999999 | -0.75 | -1.25 | -3.5 |
| -0.238999999999999 | -0.75 | -1.25 | -3.5 |
| -0.237999999999999 | -0.75 | -1.25 | -3.5 |
| -0.236999999999999 | -0.75 | -1.25 | -3.5 |
| -0.235999999999999 | -0.75 | -1.25 | -3.5 |
| -0.234999999999999 | -0.75 | -1.25 | -3.5 |
| -0.233999999999999 | -0.75 | -1.25 | -3.5 |
| -0.232999999999999 | -0.75 | -1.25 | -3.5 |
| -0.231999999999999 | -0.75 | -1.25 | -3.5 |
| -0.230999999999999 | -0.75 | -1.25 | -3.5 |
| -0.229999999999999 | -0.75 | -1.25 | -3.5 |
| -0.228999999999999 | -0.75 | -1.25 | -3.5 |
| -0.227999999999999 | -0.75 | -1.25 | -3.5 |
| -0.226999999999999 | -0.75 | -1.25 | -3.5 |
| -0.225999999999999 | -0.75 | -1.25 | -3.5 |
| -0.224999999999999 | -0.75 | -1.25 | -3.5 |
| -0.223999999999999 | -0.75 | -1.25 | -3.5 |
| -0.222999999999999 | -0.75 | -1.25 | -3.5 |
| -0.221999999999999 | -0.75 | -1.25 | -3.5 |
| -0.220999999999999 | -0.75 | -1.25 | -3.5 |
| -0.219999999999999 | -0.75 | -1.25 | -3.5 |
| -0.218999999999999 | -0.75 | -1.25 | -3.5 |
| -0.217999999999999 | -0.75 | -1.25 | -3.5 |
| -0.216999999999999 | -0.75 | -1.25 | -3.5 |
| -0.215999999999999 | -0.75 | -1.25 | -3.5 |
| -0.214999999999999 | -0.75 | -1.25 | -3.5 |
| -0.213999999999999 | -0.75 | -1.25 | -3.5 |
| -0.212999999999999 | -0.75 | -1.25 | -3.5 |
| -0.211999999999999 | -0.75 | -1.25 | -3.5 |
| -0.210999999999999 | -0.75 | -1.25 | -3.5 |
| -0.209999999999999 | -0.75 | -1.25 | -3.5 |
| -0.208999999999999 | -0.75 | -1.25 | -3.5 |
| -0.207999999999999 | -0.75 | -1.25 | -3.5 |
| -0.206999999999999 | -0.75 | -1.25 | -3.5 |
| -0.205999999999999 | -0.75 | -1.25 | -3.5 |
| -0.204999999999999 | -0.75 | -1.25 | -3.5 |
| -0.203999999999999 | -0.75 | -1.25 | -3.5 |
| -0.202999999999999 | -0.75 | -1.25 | -3.5 |
| -0.201999999999999 | -0.75 | -1.25 | -3.5 |
| -0.200999999999999 | -0.75 | -1.25 | -3.5 |
| -0.199999999999999 | -0.75 | -1.25 | -3.5 |
| -0.198999999999999 | -0.75 | -1.25 | -3.5 |
| -0.197999999999999 | -0.75 | -1.25 | -3.5 |
| -0.196999999999999 | -0.75 | -1.25 | -3.5 |
| -0.195999999999999 | -0.75 | -1.25 | -3.5 |
| -0.194999999999999 | -0.75 | -1.25 | -3.5 |
| -0.193999999999999 | -0.75 | -1.25 | -3.5 |
| -0.192999999999999 | -0.75 | -1.25 | -3.5 |
| -0.191999999999999 | -0.75 | -1.25 | -3.5 |
| -0.190999999999999 | -0.75 | -1.25 | -3.5 |
| -0.189999999999999 | -0.75 | -1.25 | -3.5 |
| -0.188999999999999 | -0.75 | -1.25 | -3.5 |
| -0.187999999999999 | -0.75 | -1.25 | -3.5 |
| -0.186999999999999 | -0.75 | -1.25 | -3.5 |
| -0.185999999999999 | -0.75 | -1.25 | -3.5 |
| -0.184999999999999 | -0.75 | -1.25 | -3.5 |
| -0.183999999999999 | -0.75 | -1.25 | -3.5 |
| -0.182999999999999 | -0.75 | -1.25 | -3.5 |
| -0.181999999999999 | -0.75 | -1.25 | -3.5 |
| -0.180999999999999 | -0.75 | -1.25 | -3.5 |
| -0.179999999999999 | -0.75 | -1.25 | -3.5 |
| -0.178999999999999 | -0.75 | -1.25 | -3.5 |
| -0.177999999999999 | -0.75 | -1.25 | -3.5 |
| -0.176999999999999 | -0.75 | -1.25 | -3.5 |
| -0.175999999999999 | -0.75 | -1.25 | -3.5 |
| -0.174999999999999 | -0.75 | -1.25 | -3.5 |
| -0.173999999999999 | -0.75 | -1.25 | -3.5 |
| -0.172999999999999 | -0.75 | -1.25 | -3.5 |
| -0.171999999999999 | -0.75 | -1.25 | -3.5 |
| -0.170999999999999 | -0.75 | -1.25 | -3.5 |
| -0.169999999999999 | -0.75 | -1.25 | -3.5 |
| -0.168999999999999 | -0.75 | -1.25 | -3.5 |
| -0.167999999999999 | -0.75 | -1.25 | -3.5 |
| -0.166999999999999 | -0.75 | -1.25 | -3.5 |
| -0.165999999999999 | -0.75 | -1.25 | -3.5 |
| -0.164999999999999 | -0.75 | -1.25 | -3.5 |
| -0.163999999999999 | -0.75 | -1.25 | -3.5 |
| -0.162999999999999 | -0.75 | -1.25 | -3.5 |
| -0.161999999999999 | -0.75 | -1.25 | -3.5 |
| -0.160999999999999 | -0.75 | -1.25 | -3.5 |
| -0.159999999999999 | -0.75 | -1.25 | -3.5 |
| -0.158999999999999 | -0.75 | -1.25 | -3.5 |
| -0.157999999999999 | -0.75 | -1.25 | -3.5 |
| -0.156999999999999 | -0.75 | -1.25 | -3.5 |
| -0.155999999999999 | -0.75 | -1.25 | -3.5 |
| -0.154999999999999 | -0.75 | -1.25 | -3.5 |
| -0.153999999999999 | -0.75 | -1.25 | -3.5 |
| -0.152999999999999 | -0.75 | -1.25 | -3.5 |
| -0.151999999999999 | -0.75 | -1.25 | -3.5 |
| -0.150999999999999 | -0.75 | -1.25 | -3.5 |
| -0.149999999999999 | -0.75 | -1.25 | -3.5 |
| -0.148999999999999 | -0.75 | -1.25 | -3.5 |
| -0.147999999999999 | -0.75 | -1.25 | -3.5 |
| -0.146999999999999 | -0.75 | -1.25 | -3.5 |
| -0.145999999999999 | -0.75 | -1.25 | -3.5 |
| -0.144999999999999 | -0.75 | -1.25 | -3.5 |
| -0.143999999999999 | -0.75 | -1.25 | -3.5 |
| -0.142999999999999 | -0.75 | -1.25 | -3.5 |
| -0.141999999999999 | -0.75 | -1.25 | -3.5 |
| -0.140999999999999 | -0.75 | -1.25 | -3.5 |
| -0.139999999999999 | -0.75 | -1.25 | -3.5 |
| -0.138999999999999 | -0.75 | -1.25 | -3.5 |
| -0.137999999999999 | -0.75 | -1.25 | -3.5 |
| -0.136999999999999 | -0.75 | -1.25 | -3.5 |
| -0.135999999999999 | -0.75 | -1.25 | -3.5 |
| -0.134999999999999 | -0.75 | -1.25 | -3.5 |
| -0.133999999999999 | -0.75 | -1.25 | -3.5 |
| -0.132999999999999 | -0.75 | -1.25 | -3.5 |
| -0.131999999999999 | -0.75 | -1.25 | -3.5 |
| -0.130999999999999 | -0.75 | -1.25 | -3.5 |
| -0.129999999999999 | -0.75 | -1.25 | -3.5 |
| -0.128999999999999 | -0.75 | -1.25 | -3.5 |
| -0.127999999999999 | -0.75 | -1.25 | -3.5 |
| -0.126999999999999 | -0.75 | -1.25 | -3.5 |
| -0.125999999999999 | -0.75 | -1.25 | -3.5 |
| -0.124999999999999 | -0.75 | -1.25 | -3.5 |
| -0.123999999999999 | -0.75 | -1.25 | -3.5 |
| -0.122999999999999 | -0.75 | -1.25 | -3.5 |
| -0.121999999999999 | -0.75 | -1.25 | -3.5 |
| -0.120999999999999 | -0.75 | -1.25 | -3.5 |
| -0.119999999999999 | -0.75 | -1.25 | -3.5 |
| -0.118999999999999 | -0.75 | -1.25 | -3.5 |
| -0.117999999999999 | -0.75 | -1.25 | -3.5 |
| -0.116999999999999 | -0.75 | -1.25 | -3.5 |
| -0.115999999999999 | -0.75 | -1.25 | -3.5 |
| -0.114999999999999 | -0.75 | -1.25 | -3.5 |
| -0.113999999999999 | -0.75 | -1.25 | -3.5 |
| -0.112999999999999 | -0.75 | -1.25 | -3.5 |
| -0.111999999999999 | -0.75 | -1.25 | -3.5 |
| -0.110999999999999 | -0.75 | -1.25 | -3.5 |
| -0.109999999999999 | -0.75 | -1.25 | -3.5 |
| -0.108999999999999 | -0.75 | -1.25 | -3.5 |
| -0.107999999999999 | -0.75 | -1.25 | -3.5 |
| -0.106999999999999 | -0.75 | -1.25 | -3.5 |
| -0.105999999999999 | -0.75 | -1.25 | -3.5 |
| -0.104999999999999 | -0.75 | -1.25 | -3.5 |
| -0.103999999999999 | -0.75 | -1.25 | -3.5 |
| -0.102999999999999 | -0.75 | -1.25 | -3.5 |
| -0.101999999999999 | -0.75 | -1.25 | -3.5 |
| -0.100999999999999 | -0.75 | -1.25 | -3.5 |
| -0.0999999999999992 | -0.75 | -1.25 | -3.5 |
| -0.0989999999999992 | -0.75 | -1.25 | -3.5 |
| -0.0979999999999992 | -0.75 | -1.25 | -3.5 |
| -0.0969999999999992 | -0.75 | -1.25 | -3.5 |
| -0.0959999999999992 | -0.75 | -1.25 | -3.5 |
| -0.0949999999999992 | -0.75 | -1.25 | -3.5 |
| -0.0939999999999992 | -0.75 | -1.25 | -3.5 |
| -0.0929999999999992 | -0.75 | -1.25 | -3.5 |
| -0.0919999999999992 | -0.75 | -1.25 | -3.5 |
| -0.0909999999999992 | -0.75 | -1.25 | -3.5 |
| -0.0899999999999992 | -0.75 | -1.25 | -3.5 |
| -0.0889999999999992 | -0.75 | -1.25 | -3.5 |
| -0.0879999999999992 | -0.75 | -1.25 | -3.5 |
| -0.0869999999999992 | -0.75 | -1.25 | -3.5 |
| -0.0859999999999992 | -0.75 | -1.25 | -3.5 |
| -0.0849999999999992 | -0.75 | -1.25 | -3.5 |
| -0.0839999999999992 | -0.75 | -1.25 | -3.5 |
| -0.0829999999999992 | -0.75 | -1.25 | -3.5 |
| -0.0819999999999992 | -0.75 | -1.25 | -3.5 |
| -0.0809999999999992 | -0.75 | -1.25 | -3.5 |
| -0.0799999999999992 | -0.75 | -1.25 | -3.5 |
| -0.0789999999999992 | -0.75 | -1.25 | -3.5 |
| -0.0779999999999992 | -0.75 | -1.25 | -3.5 |
| -0.0769999999999992 | -0.75 | -1.25 | -3.5 |
| -0.0759999999999992 | -0.75 | -1.25 | -3.5 |
| -0.0749999999999992 | -0.75 | -1.25 | -3.5 |
| -0.0739999999999992 | -0.75 | -1.25 | -3.5 |
| -0.0729999999999992 | -0.75 | -1.25 | -3.5 |
| -0.0719999999999992 | -0.75 | -1.25 | -3.5 |
| -0.0709999999999992 | -0.75 | -1.25 | -3.5 |
| -0.0699999999999992 | -0.75 | -1.25 | -3.5 |
| -0.0689999999999992 | -0.75 | -1.25 | -3.5 |
| -0.0679999999999992 | -0.75 | -1.25 | -3.5 |
| -0.0669999999999992 | -0.75 | -1.25 | -3.5 |
| -0.0659999999999992 | -0.75 | -1.25 | -3.5 |
| -0.0649999999999992 | -0.75 | -1.25 | -3.5 |
| -0.0639999999999992 | -0.75 | -1.25 | -3.5 |
| -0.0629999999999992 | -0.75 | -1.25 | -3.5 |
| -0.0619999999999992 | -0.75 | -1.25 | -3.5 |
| -0.0609999999999992 | -0.75 | -1.25 | -3.5 |
| -0.0599999999999992 | -0.75 | -1.25 | -3.5 |
| -0.0589999999999992 | -0.75 | -1.25 | -3.5 |
| -0.0579999999999992 | -0.75 | -1.25 | -3.5 |
| -0.0569999999999992 | -0.75 | -1.25 | -3.5 |
| -0.0559999999999992 | -0.75 | -1.25 | -3.5 |
| -0.0549999999999991 | -0.75 | -1.25 | -3.5 |
| -0.0539999999999991 | -0.75 | -1.25 | -3.5 |
| -0.0529999999999991 | -0.75 | -1.25 | -3.5 |
| -0.0519999999999991 | -0.75 | -1.25 | -3.5 |
| -0.0509999999999991 | -0.75 | -1.25 | -3.5 |
| -0.0499999999999991 | -0.75 | -1.25 | -3.5 |
| -0.0489999999999991 | -0.75 | -1.25 | -3.5 |
| -0.0479999999999991 | -0.75 | -1.25 | -3.5 |
| -0.0469999999999991 | -0.75 | -1.25 | -3.5 |
| -0.0459999999999991 | -0.75 | -1.25 | -3.5 |
| -0.0449999999999991 | -0.75 | -1.25 | -3.5 |
| -0.0439999999999991 | -0.75 | -1.25 | -3.5 |
| -0.0429999999999991 | -0.75 | -1.25 | -3.5 |
| -0.0419999999999991 | -0.75 | -1.25 | -3.5 |
| -0.0409999999999991 | -0.75 | -1.25 | -3.5 |
| -0.0399999999999991 | -0.75 | -1.25 | -3.5 |
| -0.0389999999999991 | -0.75 | -1.25 | -3.5 |
| -0.0379999999999991 | -0.75 | -1.25 | -3.5 |
| -0.0369999999999991 | -0.75 | -1.25 | -3.5 |
| -0.0359999999999991 | -0.75 | -1.25 | -3.5 |
| -0.0349999999999991 | -0.75 | -1.25 | -3.5 |
| -0.0339999999999991 | -0.75 | -1.25 | -3.5 |
| -0.0329999999999991 | -0.75 | -1.25 | -3.5 |
| -0.0319999999999991 | -0.75 | -1.25 | -3.5 |
| -0.0309999999999991 | -0.75 | -1.25 | -3.5 |
| -0.0299999999999991 | -0.75 | -1.25 | -3.5 |
| -0.0289999999999991 | -0.75 | -1.25 | -3.5 |
| -0.0279999999999991 | -0.75 | -1.25 | -3.5 |
| -0.0269999999999991 | -0.75 | -1.25 | -3.5 |
| -0.0259999999999991 | -0.75 | -1.25 | -3.5 |
| -0.0249999999999991 | -0.75 | -1.25 | -3.5 |
| -0.0239999999999991 | -0.75 | -1.25 | -3.5 |
| -0.0229999999999991 | -0.75 | -1.25 | -3.5 |
| -0.0219999999999991 | -0.75 | -1.25 | -3.5 |
| -0.0209999999999991 | -0.75 | -1.25 | -3.5 |
| -0.0199999999999991 | -0.75 | -1.25 | -3.5 |
| -0.0189999999999991 | -0.75 | -1.25 | -3.5 |
| -0.0179999999999991 | -0.75 | -1.25 | -3.5 |
| -0.0169999999999991 | -0.75 | -1.25 | -3.5 |
| -0.0159999999999991 | -0.75 | -1.25 | -3.5 |
| -0.0149999999999991 | -0.75 | -1.25 | -3.5 |
| -0.0139999999999991 | -0.75 | -1.25 | -3.5 |
| -0.0129999999999991 | -0.75 | -1.25 | -3.5 |
| -0.0119999999999991 | -0.75 | -1.25 | -3.5 |
| -0.0109999999999991 | -0.75 | -1.25 | -3.5 |
| -0.00999999999999912 | -0.75 | -1.25 | -3.5 |
| -0.00899999999999912 | -0.75 | -1.25 | -3.5 |
| -0.00799999999999912 | -0.75 | -1.25 | -3.5 |
| -0.00699999999999912 | -0.75 | -1.25 | -3.5 |
| -0.00599999999999912 | -0.75 | -1.25 | -3.5 |
| -0.00499999999999912 | -0.75 | -1.25 | -3.5 |
| -0.00399999999999912 | -0.75 | -1.25 | -3.5 |
| -0.00299999999999912 | -0.75 | -1.25 | -3.5 |
| -0.00199999999999912 | -0.75 | -1.25 | -3.5 |
| -0.000999999999999118 | -0.75 | -1.25 | -3.5 |
| 8.81239525796218e-16 | -0.75 | -1.25 | -3.5 |
| 0.00100000000000088 | 0.75 | 1.25 | 3.5 |
| 0.00200000000000088 | 0.75 | 1.25 | 3.5 |
| 0.00300000000000088 | 0.75 | 1.25 | 3.5 |
| 0.00400000000000088 | 0.75 | 1.25 | 3.5 |
| 0.00500000000000088 | 0.75 | 1.25 | 3.5 |
| 0.00600000000000088 | 0.75 | 1.25 | 3.5 |
| 0.00700000000000088 | 0.75 | 1.25 | 3.5 |
| 0.00800000000000088 | 0.75 | 1.25 | 3.5 |
| 0.00900000000000088 | 0.75 | 1.25 | 3.5 |
| 0.0100000000000009 | 0.75 | 1.25 | 3.5 |
| 0.0110000000000009 | 0.75 | 1.25 | 3.5 |
| 0.0120000000000009 | 0.75 | 1.25 | 3.5 |
| 0.0130000000000009 | 0.75 | 1.25 | 3.5 |
| 0.0140000000000009 | 0.75 | 1.25 | 3.5 |
| 0.0150000000000009 | 0.75 | 1.25 | 3.5 |
| 0.0160000000000009 | 0.75 | 1.25 | 3.5 |
| 0.0170000000000009 | 0.75 | 1.25 | 3.5 |
| 0.0180000000000009 | 0.75 | 1.25 | 3.5 |
| 0.0190000000000009 | 0.75 | 1.25 | 3.5 |
| 0.0200000000000009 | 0.75 | 1.25 | 3.5 |
| 0.0210000000000009 | 0.75 | 1.25 | 3.5 |
| 0.0220000000000009 | 0.75 | 1.25 | 3.5 |
| 0.0230000000000009 | 0.75 | 1.25 | 3.5 |
| 0.0240000000000009 | 0.75 | 1.25 | 3.5 |
| 0.0250000000000009 | 0.75 | 1.25 | 3.5 |
| 0.0260000000000009 | 0.75 | 1.25 | 3.5 |
| 0.0270000000000009 | 0.75 | 1.25 | 3.5 |
| 0.0280000000000009 | 0.75 | 1.25 | 3.5 |
| 0.0290000000000009 | 0.75 | 1.25 | 3.5 |
| 0.0300000000000009 | 0.75 | 1.25 | 3.5 |
| 0.0310000000000009 | 0.75 | 1.25 | 3.5 |
| 0.0320000000000009 | 0.75 | 1.25 | 3.5 |
| 0.0330000000000009 | 0.75 | 1.25 | 3.5 |
| 0.0340000000000009 | 0.75 | 1.25 | 3.5 |
| 0.0350000000000009 | 0.75 | 1.25 | 3.5 |
| 0.0360000000000009 | 0.75 | 1.25 | 3.5 |
| 0.0370000000000009 | 0.75 | 1.25 | 3.5 |
| 0.0380000000000009 | 0.75 | 1.25 | 3.5 |
| 0.0390000000000009 | 0.75 | 1.25 | 3.5 |
| 0.0400000000000009 | 0.75 | 1.25 | 3.5 |
| 0.0410000000000009 | 0.75 | 1.25 | 3.5 |
| 0.0420000000000009 | 0.75 | 1.25 | 3.5 |
| 0.0430000000000009 | 0.75 | 1.25 | 3.5 |
| 0.0440000000000009 | 0.75 | 1.25 | 3.5 |
| 0.0450000000000009 | 0.75 | 1.25 | 3.5 |
| 0.0460000000000009 | 0.75 | 1.25 | 3.5 |
| 0.0470000000000009 | 0.75 | 1.25 | 3.5 |
| 0.0480000000000009 | 0.75 | 1.25 | 3.5 |
| 0.0490000000000009 | 0.75 | 1.25 | 3.5 |
| 0.0500000000000009 | 0.75 | 1.25 | 3.5 |
| 0.0510000000000009 | 0.75 | 1.25 | 3.5 |
| 0.0520000000000009 | 0.75 | 1.25 | 3.5 |
| 0.0530000000000009 | 0.75 | 1.25 | 3.5 |
| 0.0540000000000009 | 0.75 | 1.25 | 3.5 |
| 0.0550000000000009 | 0.75 | 1.25 | 3.5 |
| 0.0560000000000009 | 0.75 | 1.25 | 3.5 |
| 0.0570000000000009 | 0.75 | 1.25 | 3.5 |
| 0.0580000000000009 | 0.75 | 1.25 | 3.5 |
| 0.0590000000000009 | 0.75 | 1.25 | 3.5 |
| 0.0600000000000009 | 0.75 | 1.25 | 3.5 |
| 0.0610000000000009 | 0.75 | 1.25 | 3.5 |
| 0.0620000000000009 | 0.75 | 1.25 | 3.5 |
| 0.0630000000000009 | 0.75 | 1.25 | 3.5 |
| 0.0640000000000009 | 0.75 | 1.25 | 3.5 |
| 0.0650000000000009 | 0.75 | 1.25 | 3.5 |
| 0.0660000000000009 | 0.75 | 1.25 | 3.5 |
| 0.0670000000000009 | 0.75 | 1.25 | 3.5 |
| 0.0680000000000009 | 0.75 | 1.25 | 3.5 |
| 0.0690000000000009 | 0.75 | 1.25 | 3.5 |
| 0.0700000000000009 | 0.75 | 1.25 | 3.5 |
| 0.0710000000000009 | 0.75 | 1.25 | 3.5 |
| 0.0720000000000009 | 0.75 | 1.25 | 3.5 |
| 0.0730000000000009 | 0.75 | 1.25 | 3.5 |
| 0.0740000000000009 | 0.75 | 1.25 | 3.5 |
| 0.0750000000000009 | 0.75 | 1.25 | 3.5 |
| 0.0760000000000009 | 0.75 | 1.25 | 3.5 |
| 0.0770000000000009 | 0.75 | 1.25 | 3.5 |
| 0.0780000000000009 | 0.75 | 1.25 | 3.5 |
| 0.0790000000000009 | 0.75 | 1.25 | 3.5 |
| 0.0800000000000009 | 0.75 | 1.25 | 3.5 |
| 0.0810000000000009 | 0.75 | 1.25 | 3.5 |
| 0.0820000000000009 | 0.75 | 1.25 | 3.5 |
| 0.0830000000000009 | 0.75 | 1.25 | 3.5 |
| 0.0840000000000009 | 0.75 | 1.25 | 3.5 |
| 0.0850000000000009 | 0.75 | 1.25 | 3.5 |
| 0.0860000000000009 | 0.75 | 1.25 | 3.5 |
| 0.0870000000000009 | 0.75 | 1.25 | 3.5 |
| 0.0880000000000009 | 0.75 | 1.25 | 3.5 |
| 0.0890000000000009 | 0.75 | 1.25 | 3.5 |
| 0.0900000000000009 | 0.75 | 1.25 | 3.5 |
| 0.0910000000000009 | 0.75 | 1.25 | 3.5 |
| 0.0920000000000009 | 0.75 | 1.25 | 3.5 |
| 0.0930000000000009 | 0.75 | 1.25 | 3.5 |
| 0.0940000000000009 | 0.75 | 1.25 | 3.5 |
| 0.0950000000000009 | 0.75 | 1.25 | 3.5 |
| 0.0960000000000009 | 0.75 | 1.25 | 3.5 |
| 0.0970000000000009 | 0.75 | 1.25 | 3.5 |
| 0.0980000000000009 | 0.75 | 1.25 | 3.5 |
| 0.0990000000000009 | 0.75 | 1.25 | 3.5 |
| 0.100000000000001 | 0.75 | 1.25 | 3.5 |
| 0.101000000000001 | 0.75 | 1.25 | 3.5 |
| 0.102000000000001 | 0.75 | 1.25 | 3.5 |
| 0.103000000000001 | 0.75 | 1.25 | 3.5 |
| 0.104000000000001 | 0.75 | 1.25 | 3.5 |
| 0.105000000000001 | 0.75 | 1.25 | 3.5 |
| 0.106000000000001 | 0.75 | 1.25 | 3.5 |
| 0.107000000000001 | 0.75 | 1.25 | 3.5 |
| 0.108000000000001 | 0.75 | 1.25 | 3.5 |
| 0.109000000000001 | 0.75 | 1.25 | 3.5 |
| 0.110000000000001 | 0.75 | 1.25 | 3.5 |
| 0.111000000000001 | 0.75 | 1.25 | 3.5 |
| 0.112000000000001 | 0.75 | 1.25 | 3.5 |
| 0.113000000000001 | 0.75 | 1.25 | 3.5 |
| 0.114000000000001 | 0.75 | 1.25 | 3.5 |
| 0.115000000000001 | 0.75 | 1.25 | 3.5 |
| 0.116000000000001 | 0.75 | 1.25 | 3.5 |
| 0.117000000000001 | 0.75 | 1.25 | 3.5 |
| 0.118000000000001 | 0.75 | 1.25 | 3.5 |
| 0.119000000000001 | 0.75 | 1.25 | 3.5 |
| 0.120000000000001 | 0.75 | 1.25 | 3.5 |
| 0.121000000000001 | 0.75 | 1.25 | 3.5 |
| 0.122000000000001 | 0.75 | 1.25 | 3.5 |
| 0.123000000000001 | 0.75 | 1.25 | 3.5 |
| 0.124000000000001 | 0.75 | 1.25 | 3.5 |
| 0.125000000000001 | 0.75 | 1.25 | 3.5 |
| 0.126000000000001 | 0.75 | 1.25 | 3.5 |
| 0.127000000000001 | 0.75 | 1.25 | 3.5 |
| 0.128000000000001 | 0.75 | 1.25 | 3.5 |
| 0.129000000000001 | 0.75 | 1.25 | 3.5 |
| 0.130000000000001 | 0.75 | 1.25 | 3.5 |
| 0.131000000000001 | 0.75 | 1.25 | 3.5 |
| 0.132000000000001 | 0.75 | 1.25 | 3.5 |
| 0.133000000000001 | 0.75 | 1.25 | 3.5 |
| 0.134000000000001 | 0.75 | 1.25 | 3.5 |
| 0.135000000000001 | 0.75 | 1.25 | 3.5 |
| 0.136000000000001 | 0.75 | 1.25 | 3.5 |
| 0.137000000000001 | 0.75 | 1.25 | 3.5 |
| 0.138000000000001 | 0.75 | 1.25 | 3.5 |
| 0.139000000000001 | 0.75 | 1.25 | 3.5 |
| 0.140000000000001 | 0.75 | 1.25 | 3.5 |
| 0.141000000000001 | 0.75 | 1.25 | 3.5 |
| 0.142000000000001 | 0.75 | 1.25 | 3.5 |
| 0.143000000000001 | 0.75 | 1.25 | 3.5 |
| 0.144000000000001 | 0.75 | 1.25 | 3.5 |
| 0.145000000000001 | 0.75 | 1.25 | 3.5 |
| 0.146000000000001 | 0.75 | 1.25 | 3.5 |
| 0.147000000000001 | 0.75 | 1.25 | 3.5 |
| 0.148000000000001 | 0.75 | 1.25 | 3.5 |
| 0.149000000000001 | 0.75 | 1.25 | 3.5 |
| 0.150000000000001 | 0.75 | 1.25 | 3.5 |
| 0.151000000000001 | 0.75 | 1.25 | 3.5 |
| 0.152000000000001 | 0.75 | 1.25 | 3.5 |
| 0.153000000000001 | 0.75 | 1.25 | 3.5 |
| 0.154000000000001 | 0.75 | 1.25 | 3.5 |
| 0.155000000000001 | 0.75 | 1.25 | 3.5 |
| 0.156000000000001 | 0.75 | 1.25 | 3.5 |
| 0.157000000000001 | 0.75 | 1.25 | 3.5 |
| 0.158000000000001 | 0.75 | 1.25 | 3.5 |
| 0.159000000000001 | 0.75 | 1.25 | 3.5 |
| 0.160000000000001 | 0.75 | 1.25 | 3.5 |
| 0.161000000000001 | 0.75 | 1.25 | 3.5 |
| 0.162000000000001 | 0.75 | 1.25 | 3.5 |
| 0.163000000000001 | 0.75 | 1.25 | 3.5 |
| 0.164000000000001 | 0.75 | 1.25 | 3.5 |
| 0.165000000000001 | 0.75 | 1.25 | 3.5 |
| 0.166000000000001 | 0.75 | 1.25 | 3.5 |
| 0.167000000000001 | 0.75 | 1.25 | 3.5 |
| 0.168000000000001 | 0.75 | 1.25 | 3.5 |
| 0.169000000000001 | 0.75 | 1.25 | 3.5 |
| 0.170000000000001 | 0.75 | 1.25 | 3.5 |
| 0.171000000000001 | 0.75 | 1.25 | 3.5 |
| 0.172000000000001 | 0.75 | 1.25 | 3.5 |
| 0.173000000000001 | 0.75 | 1.25 | 3.5 |
| 0.174000000000001 | 0.75 | 1.25 | 3.5 |
| 0.175000000000001 | 0.75 | 1.25 | 3.5 |
| 0.176000000000001 | 0.75 | 1.25 | 3.5 |
| 0.177000000000001 | 0.75 | 1.25 | 3.5 |
| 0.178000000000001 | 0.75 | 1.25 | 3.5 |
| 0.179000000000001 | 0.75 | 1.25 | 3.5 |
| 0.180000000000001 | 0.75 | 1.25 | 3.5 |
| 0.181000000000001 | 0.75 | 1.25 | 3.5 |
| 0.182000000000001 | 0.75 | 1.25 | 3.5 |
| 0.183000000000001 | 0.75 | 1.25 | 3.5 |
| 0.184000000000001 | 0.75 | 1.25 | 3.5 |
| 0.185000000000001 | 0.75 | 1.25 | 3.5 |
| 0.186000000000001 | 0.75 | 1.25 | 3.5 |
| 0.187000000000001 | 0.75 | 1.25 | 3.5 |
| 0.188000000000001 | 0.75 | 1.25 | 3.5 |
| 0.189000000000001 | 0.75 | 1.25 | 3.5 |
| 0.190000000000001 | 0.75 | 1.25 | 3.5 |
| 0.191000000000001 | 0.75 | 1.25 | 3.5 |
| 0.192000000000001 | 0.75 | 1.25 | 3.5 |
| 0.193000000000001 | 0.75 | 1.25 | 3.5 |
| 0.194000000000001 | 0.75 | 1.25 | 3.5 |
| 0.195000000000001 | 0.75 | 1.25 | 3.5 |
| 0.196000000000001 | 0.75 | 1.25 | 3.5 |
| 0.197000000000001 | 0.75 | 1.25 | 3.5 |
| 0.198000000000001 | 0.75 | 1.25 | 3.5 |
| 0.199000000000001 | 0.75 | 1.25 | 3.5 |
| 0.200000000000001 | 0.75 | 1.25 | 3.5 |
| 0.201000000000001 | 0.75 | 1.25 | 3.5 |
| 0.202000000000001 | 0.75 | 1.25 | 3.5 |
| 0.203000000000001 | 0.75 | 1.25 | 3.5 |
| 0.204000000000001 | 0.75 | 1.25 | 3.5 |
| 0.205000000000001 | 0.75 | 1.25 | 3.5 |
| 0.206000000000001 | 0.75 | 1.25 | 3.5 |
| 0.207000000000001 | 0.75 | 1.25 | 3.5 |
| 0.208000000000001 | 0.75 | 1.25 | 3.5 |
| 0.209000000000001 | 0.75 | 1.25 | 3.5 |
| 0.210000000000001 | 0.75 | 1.25 | 3.5 |
| 0.211000000000001 | 0.75 | 1.25 | 3.5 |
| 0.212000000000001 | 0.75 | 1.25 | 3.5 |
| 0.213000000000001 | 0.75 | 1.25 | 3.5 |
| 0.214000000000001 | 0.75 | 1.25 | 3.5 |
| 0.215000000000001 | 0.75 | 1.25 | 3.5 |
| 0.216000000000001 | 0.75 | 1.25 | 3.5 |
| 0.217000000000001 | 0.75 | 1.25 | 3.5 |
| 0.218000000000001 | 0.75 | 1.25 | 3.5 |
| 0.219000000000001 | 0.75 | 1.25 | 3.5 |
| 0.220000000000001 | 0.75 | 1.25 | 3.5 |
| 0.221000000000001 | 0.75 | 1.25 | 3.5 |
| 0.222000000000001 | 0.75 | 1.25 | 3.5 |
| 0.223000000000001 | 0.75 | 1.25 | 3.5 |
| 0.224000000000001 | 0.75 | 1.25 | 3.5 |
| 0.225000000000001 | 0.75 | 1.25 | 3.5 |
| 0.226000000000001 | 0.75 | 1.25 | 3.5 |
| 0.227000000000001 | 0.75 | 1.25 | 3.5 |
| 0.228000000000001 | 0.75 | 1.25 | 3.5 |
| 0.229000000000001 | 0.75 | 1.25 | 3.5 |
| 0.230000000000001 | 0.75 | 1.25 | 3.5 |
| 0.231000000000001 | 0.75 | 1.25 | 3.5 |
| 0.232000000000001 | 0.75 | 1.25 | 3.5 |
| 0.233000000000001 | 0.75 | 1.25 | 3.5 |
| 0.234000000000001 | 0.75 | 1.25 | 3.5 |
| 0.235000000000001 | 0.75 | 1.25 | 3.5 |
| 0.236000000000001 | 0.75 | 1.25 | 3.5 |
| 0.237000000000001 | 0.75 | 1.25 | 3.5 |
| 0.238000000000001 | 0.75 | 1.25 | 3.5 |
| 0.239000000000001 | 0.75 | 1.25 | 3.5 |
| 0.240000000000001 | 0.75 | 1.25 | 3.5 |
| 0.241000000000001 | 0.75 | 1.25 | 3.5 |
| 0.242000000000001 | 0.75 | 1.25 | 3.5 |
| 0.243000000000001 | 0.75 | 1.25 | 3.5 |
| 0.244000000000001 | 0.75 | 1.25 | 3.5 |
| 0.245000000000001 | 0.75 | 1.25 | 3.5 |
| 0.246000000000001 | 0.75 | 1.25 | 3.5 |
| 0.247000000000001 | 0.75 | 1.25 | 3.5 |
| 0.248000000000001 | 0.75 | 1.25 | 3.5 |
| 0.249000000000001 | 0.75 | 1.25 | 3.5 |
| 0.250000000000001 | 0.75 | 1.25 | 3.5 |
| 0.251000000000001 | 0.75 | 1.25 | 3.5 |
| 0.252000000000001 | 0.75 | 1.25 | 3.5 |
| 0.253000000000001 | 0.75 | 1.25 | 3.5 |
| 0.254000000000001 | 0.75 | 1.25 | 3.5 |
| 0.255000000000001 | 0.75 | 1.25 | 3.5 |
| 0.256000000000001 | 0.75 | 1.25 | 3.5 |
| 0.257000000000001 | 0.75 | 1.25 | 3.5 |
| 0.258000000000001 | 0.75 | 1.25 | 3.5 |
| 0.259000000000001 | 0.75 | 1.25 | 3.5 |
| 0.260000000000001 | 0.75 | 1.25 | 3.5 |
| 0.261000000000001 | 0.75 | 1.25 | 3.5 |
| 0.262000000000001 | 0.75 | 1.25 | 3.5 |
| 0.263000000000001 | 0.75 | 1.25 | 3.5 |
| 0.264000000000001 | 0.75 | 1.25 | 3.5 |
| 0.265000000000001 | 0.75 | 1.25 | 3.5 |
| 0.266000000000001 | 0.75 | 1.25 | 3.5 |
| 0.267000000000001 | 0.75 | 1.25 | 3.5 |
| 0.268000000000001 | 0.75 | 1.25 | 3.5 |
| 0.269000000000001 | 0.75 | 1.25 | 3.5 |
| 0.270000000000001 | 0.75 | 1.25 | 3.5 |
| 0.271000000000001 | 0.75 | 1.25 | 3.5 |
| 0.272000000000001 | 0.75 | 1.25 | 3.5 |
| 0.273000000000001 | 0.75 | 1.25 | 3.5 |
| 0.274000000000001 | 0.75 | 1.25 | 3.5 |
| 0.275000000000001 | 0.75 | 1.25 | 3.5 |
| 0.276000000000001 | 0.75 | 1.25 | 3.5 |
| 0.277000000000001 | 0.75 | 1.25 | 3.5 |
| 0.278000000000001 | 0.75 | 1.25 | 3.5 |
| 0.279000000000001 | 0.75 | 1.25 | 3.5 |
| 0.280000000000001 | 0.75 | 1.25 | 3.5 |
| 0.281000000000001 | 0.75 | 1.25 | 3.5 |
| 0.282000000000001 | 0.75 | 1.25 | 3.5 |
| 0.283000000000001 | 0.75 | 1.25 | 3.5 |
| 0.284000000000001 | 0.75 | 1.25 | 3.5 |
| 0.285000000000001 | 0.75 | 1.25 | 3.5 |
| 0.286000000000001 | 0.75 | 1.25 | 3.5 |
| 0.287000000000001 | 0.75 | 1.25 | 3.5 |
| 0.288000000000001 | 0.75 | 1.25 | 3.5 |
| 0.289000000000001 | 0.75 | 1.25 | 3.5 |
| 0.290000000000001 | 0.75 | 1.25 | 3.5 |
| 0.291000000000001 | 0.75 | 1.25 | 3.5 |
| 0.292000000000001 | 0.75 | 1.25 | 3.5 |
| 0.293000000000001 | 0.75 | 1.25 | 3.5 |
| 0.294000000000001 | 0.75 | 1.25 | 3.5 |
| 0.295000000000001 | 0.75 | 1.25 | 3.5 |
| 0.296000000000001 | 0.75 | 1.25 | 3.5 |
| 0.297000000000001 | 0.75 | 1.25 | 3.5 |
| 0.298000000000001 | 0.75 | 1.25 | 3.5 |
| 0.299000000000001 | 0.75 | 1.25 | 3.5 |
| 0.300000000000001 | 0.75 | 1.25 | 3.5 |
| 0.301000000000001 | 0.75 | 1.25 | 3.5 |
| 0.302000000000001 | 0.75 | 1.25 | 3.5 |
| 0.303000000000001 | 0.75 | 1.25 | 3.5 |
| 0.304000000000001 | 0.75 | 1.25 | 3.5 |
| 0.305000000000001 | 0.75 | 1.25 | 3.5 |
| 0.306000000000001 | 0.75 | 1.25 | 3.5 |
| 0.307000000000001 | 0.75 | 1.25 | 3.5 |
| 0.308000000000001 | 0.75 | 1.25 | 3.5 |
| 0.309000000000001 | 0.75 | 1.25 | 3.5 |
| 0.310000000000001 | 0.75 | 1.25 | 3.5 |
| 0.311000000000001 | 0.75 | 1.25 | 3.5 |
| 0.312000000000001 | 0.75 | 1.25 | 3.5 |
| 0.313000000000001 | 0.75 | 1.25 | 3.5 |
| 0.314000000000001 | 0.75 | 1.25 | 3.5 |
| 0.315000000000001 | 0.75 | 1.25 | 3.5 |
| 0.316000000000001 | 0.75 | 1.25 | 3.5 |
| 0.317000000000001 | 0.75 | 1.25 | 3.5 |
| 0.318000000000001 | 0.75 | 1.25 | 3.5 |
| 0.319000000000001 | 0.75 | 1.25 | 3.5 |
| 0.320000000000001 | 0.75 | 1.25 | 3.5 |
| 0.321000000000001 | 0.75 | 1.25 | 3.5 |
| 0.322000000000001 | 0.75 | 1.25 | 3.5 |
| 0.323000000000001 | 0.75 | 1.25 | 3.5 |
| 0.324000000000001 | 0.75 | 1.25 | 3.5 |
| 0.325000000000001 | 0.75 | 1.25 | 3.5 |
| 0.326000000000001 | 0.75 | 1.25 | 3.5 |
| 0.327000000000001 | 0.75 | 1.25 | 3.5 |
| 0.328000000000001 | 0.75 | 1.25 | 3.5 |
| 0.329000000000001 | 0.75 | 1.25 | 3.5 |
| 0.330000000000001 | 0.75 | 1.25 | 3.5 |
| 0.331000000000001 | 0.75 | 1.25 | 3.5 |
| 0.332000000000001 | 0.75 | 1.25 | 3.5 |
| 0.333000000000001 | 0.75 | 1.25 | 3.5 |
| 0.334000000000001 | 0.75 | 1.25 | 3.5 |
| 0.335000000000001 | 0.75 | 1.25 | 3.5 |
| 0.336000000000001 | 0.75 | 1.25 | 3.5 |
| 0.337000000000001 | 0.75 | 1.25 | 3.5 |
| 0.338000000000001 | 0.75 | 1.25 | 3.5 |
| 0.339000000000001 | 0.75 | 1.25 | 3.5 |
| 0.340000000000001 | 0.75 | 1.25 | 3.5 |
| 0.341000000000001 | 0.75 | 1.25 | 3.5 |
| 0.342000000000001 | 0.75 | 1.25 | 3.5 |
| 0.343000000000001 | 0.75 | 1.25 | 3.5 |
| 0.344000000000001 | 0.75 | 1.25 | 3.5 |
| 0.345000000000001 | 0.75 | 1.25 | 3.5 |
| 0.346000000000001 | 0.75 | 1.25 | 3.5 |
| 0.347000000000001 | 0.75 | 1.25 | 3.5 |
| 0.348000000000001 | 0.75 | 1.25 | 3.5 |
| 0.349000000000001 | 0.75 | 1.25 | 3.5 |
| 0.350000000000001 | 0.75 | 1.25 | 3.5 |
| 0.351000000000001 | 0.75 | 1.25 | 3.5 |
| 0.352000000000001 | 0.75 | 1.25 | 3.5 |
| 0.353000000000001 | 0.75 | 1.25 | 3.5 |
| 0.354000000000001 | 0.75 | 1.25 | 3.5 |
| 0.355000000000001 | 0.75 | 1.25 | 3.5 |
| 0.356000000000001 | 0.75 | 1.25 | 3.5 |
| 0.357000000000001 | 0.75 | 1.25 | 3.5 |
| 0.358000000000001 | 0.75 | 1.25 | 3.5 |
| 0.359000000000001 | 0.75 | 1.25 | 3.5 |
| 0.360000000000001 | 0.75 | 1.25 | 3.5 |
| 0.361000000000001 | 0.75 | 1.25 | 3.5 |
| 0.362000000000001 | 0.75 | 1.25 | 3.5 |
| 0.363000000000001 | 0.75 | 1.25 | 3.5 |
| 0.364000000000001 | 0.75 | 1.25 | 3.5 |
| 0.365000000000001 | 0.75 | 1.25 | 3.5 |
| 0.366000000000001 | 0.75 | 1.25 | 3.5 |
| 0.367000000000001 | 0.75 | 1.25 | 3.5 |
| 0.368000000000001 | 0.75 | 1.25 | 3.5 |
| 0.369000000000001 | 0.75 | 1.25 | 3.5 |
| 0.370000000000001 | 0.75 | 1.25 | 3.5 |
| 0.371000000000001 | 0.75 | 1.25 | 3.5 |
| 0.372000000000001 | 0.75 | 1.25 | 3.5 |
| 0.373000000000001 | 0.75 | 1.25 | 3.5 |
| 0.374000000000001 | 0.75 | 1.25 | 3.5 |
| 0.375000000000001 | 0.75 | 1.25 | 3.5 |
| 0.376000000000001 | 0.75 | 1.25 | 3.5 |
| 0.377000000000001 | 0.75 | 1.25 | 3.5 |
| 0.378000000000001 | 0.75 | 1.25 | 3.5 |
| 0.379000000000001 | 0.75 | 1.25 | 3.5 |
| 0.380000000000001 | 0.75 | 1.25 | 3.5 |
| 0.381000000000001 | 0.75 | 1.25 | 3.5 |
| 0.382000000000001 | 0.75 | 1.25 | 3.5 |
| 0.383000000000001 | 0.75 | 1.25 | 3.5 |
| 0.384000000000001 | 0.75 | 1.25 | 3.5 |
| 0.385000000000001 | 0.75 | 1.25 | 3.5 |
| 0.386000000000001 | 0.75 | 1.25 | 3.5 |
| 0.387000000000001 | 0.75 | 1.25 | 3.5 |
| 0.388000000000001 | 0.75 | 1.25 | 3.5 |
| 0.389000000000001 | 0.75 | 1.25 | 3.5 |
| 0.390000000000001 | 0.75 | 1.25 | 3.5 |
| 0.391000000000001 | 0.75 | 1.25 | 3.5 |
| 0.392000000000001 | 0.75 | 1.25 | 3.5 |
| 0.393000000000001 | 0.75 | 1.25 | 3.5 |
| 0.394000000000001 | 0.75 | 1.25 | 3.5 |
| 0.395000000000001 | 0.75 | 1.25 | 3.5 |
| 0.396000000000001 | 0.75 | 1.25 | 3.5 |
| 0.397000000000001 | 0.75 | 1.25 | 3.5 |
| 0.398000000000001 | 0.75 | 1.25 | 3.5 |
| 0.399000000000001 | 0.75 | 1.25 | 3.5 |
| 0.400000000000001 | 0.75 | 1.25 | 3.5 |
| 0.401000000000001 | 0.75 | 1.25 | 3.5 |
| 0.402000000000001 | 0.75 | 1.25 | 3.5 |
| 0.403000000000001 | 0.75 | 1.25 | 3.5 |
| 0.404000000000001 | 0.75 | 1.25 | 3.5 |
| 0.405000000000001 | 0.75 | 1.25 | 3.5 |
| 0.406000000000001 | 0.75 | 1.25 | 3.5 |
| 0.407000000000001 | 0.75 | 1.25 | 3.5 |
| 0.408000000000001 | 0.75 | 1.25 | 3.5 |
| 0.409000000000001 | 0.75 | 1.25 | 3.5 |
| 0.410000000000001 | 0.75 | 1.25 | 3.5 |
| 0.411000000000001 | 0.75 | 1.25 | 3.5 |
| 0.412000000000001 | 0.75 | 1.25 | 3.5 |
| 0.413000000000001 | 0.75 | 1.25 | 3.5 |
| 0.414000000000001 | 0.75 | 1.25 | 3.5 |
| 0.415000000000001 | 0.75 | 1.25 | 3.5 |
| 0.416000000000001 | 0.75 | 1.25 | 3.5 |
| 0.417000000000001 | 0.75 | 1.25 | 3.5 |
| 0.418000000000001 | 0.75 | 1.25 | 3.5 |
| 0.419000000000001 | 0.75 | 1.25 | 3.5 |
| 0.420000000000001 | 0.75 | 1.25 | 3.5 |
| 0.421000000000001 | 0.75 | 1.25 | 3.5 |
| 0.422000000000001 | 0.75 | 1.25 | 3.5 |
| 0.423000000000001 | 0.75 | 1.25 | 3.5 |
| 0.424000000000001 | 0.75 | 1.25 | 3.5 |
| 0.425000000000001 | 0.75 | 1.25 | 3.5 |
| 0.426000000000001 | 0.75 | 1.25 | 3.5 |
| 0.427000000000001 | 0.75 | 1.25 | 3.5 |
| 0.428000000000001 | 0.75 | 1.25 | 3.5 |
| 0.429000000000001 | 0.75 | 1.25 | 3.5 |
| 0.430000000000001 | 0.75 | 1.25 | 3.5 |
| 0.431000000000001 | 0.75 | 1.25 | 3.5 |
| 0.432000000000001 | 0.75 | 1.25 | 3.5 |
| 0.433000000000001 | 0.75 | 1.25 | 3.5 |
| 0.434000000000001 | 0.75 | 1.25 | 3.5 |
| 0.435000000000001 | 0.75 | 1.25 | 3.5 |
| 0.436000000000001 | 0.75 | 1.25 | 3.5 |
| 0.437000000000001 | 0.75 | 1.25 | 3.5 |
| 0.438000000000001 | 0.75 | 1.25 | 3.5 |
| 0.439000000000001 | 0.75 | 1.25 | 3.5 |
| 0.440000000000001 | 0.75 | 1.25 | 3.5 |
| 0.441000000000001 | 0.75 | 1.25 | 3.5 |
| 0.442000000000001 | 0.75 | 1.25 | 3.5 |
| 0.443000000000001 | 0.75 | 1.25 | 3.5 |
| 0.444000000000001 | 0.75 | 1.25 | 3.5 |
| 0.445000000000001 | 0.75 | 1.25 | 3.5 |
| 0.446000000000001 | 0.75 | 1.25 | 3.5 |
| 0.447000000000001 | 0.75 | 1.25 | 3.5 |
| 0.448000000000001 | 0.75 | 1.25 | 3.5 |
| 0.449000000000001 | 0.75 | 1.25 | 3.5 |
| 0.450000000000001 | 0.75 | 1.25 | 3.5 |
| 0.451000000000001 | 0.75 | 1.25 | 3.5 |
| 0.452000000000001 | 0.75 | 1.25 | 3.5 |
| 0.453000000000001 | 0.75 | 1.25 | 3.5 |
| 0.454000000000001 | 0.75 | 1.25 | 3.5 |
| 0.455000000000001 | 0.75 | 1.25 | 3.5 |
| 0.456000000000001 | 0.75 | 1.25 | 3.5 |
| 0.457000000000001 | 0.75 | 1.25 | 3.5 |
| 0.458000000000001 | 0.75 | 1.25 | 3.5 |
| 0.459000000000001 | 0.75 | 1.25 | 3.5 |
| 0.460000000000001 | 0.75 | 1.25 | 3.5 |
| 0.461000000000001 | 0.75 | 1.25 | 3.5 |
| 0.462000000000001 | 0.75 | 1.25 | 3.5 |
| 0.463000000000001 | 0.75 | 1.25 | 3.5 |
| 0.464000000000001 | 0.75 | 1.25 | 3.5 |
| 0.465000000000001 | 0.75 | 1.25 | 3.5 |
| 0.466000000000001 | 0.75 | 1.25 | 3.5 |
| 0.467000000000001 | 0.75 | 1.25 | 3.5 |
| 0.468000000000001 | 0.75 | 1.25 | 3.5 |
| 0.469000000000001 | 0.75 | 1.25 | 3.5 |
| 0.470000000000001 | 0.75 | 1.25 | 3.5 |
| 0.471000000000001 | 0.75 | 1.25 | 3.5 |
| 0.472000000000001 | 0.75 | 1.25 | 3.5 |
| 0.473000000000001 | 0.75 | 1.25 | 3.5 |
| 0.474000000000001 | 0.75 | 1.25 | 3.5 |
| 0.475000000000001 | 0.75 | 1.25 | 3.5 |
| 0.476000000000001 | 0.75 | 1.25 | 3.5 |
| 0.477000000000001 | 0.75 | 1.25 | 3.5 |
| 0.478000000000001 | 0.75 | 1.25 | 3.5 |
| 0.479000000000001 | 0.75 | 1.25 | 3.5 |
| 0.480000000000001 | 0.75 | 1.25 | 3.5 |
| 0.481000000000001 | 0.75 | 1.25 | 3.5 |
| 0.482000000000001 | 0.75 | 1.25 | 3.5 |
| 0.483000000000001 | 0.75 | 1.25 | 3.5 |
| 0.484000000000001 | 0.75 | 1.25 | 3.5 |
| 0.485000000000001 | 0.75 | 1.25 | 3.5 |
| 0.486000000000001 | 0.75 | 1.25 | 3.5 |
| 0.487000000000001 | 0.75 | 1.25 | 3.5 |
| 0.488000000000001 | 0.75 | 1.25 | 3.5 |
| 0.489000000000001 | 0.75 | 1.25 | 3.5 |
| 0.490000000000001 | 0.75 | 1.25 | 3.5 |
| 0.491000000000001 | 0.75 | 1.25 | 3.5 |
| 0.492000000000001 | 0.75 | 1.25 | 3.5 |
| 0.493000000000001 | 0.75 | 1.25 | 3.5 |
| 0.494000000000001 | 0.75 | 1.25 | 3.5 |
| 0.495000000000001 | 0.75 | 1.25 | 3.5 |
| 0.496000000000001 | 0.75 | 1.25 | 3.5 |
| 0.497000000000001 | 0.75 | 1.25 | 3.5 |
| 0.498000000000001 | 0.75 | 1.25 | 3.5 |
| 0.499000000000001 | 0.75 | 1.25 | 3.5 |
| 0.500000000000001 | 0.75 | 1.25 | 3.5 |
| 0.501000000000001 | 0.75 | 1.25 | 3.5 |
| 0.502000000000001 | 0.75 | 1.25 | 3.5 |
| 0.503000000000001 | 0.75 | 1.25 | 3.5 |
| 0.504000000000001 | 0.75 | 1.25 | 3.5 |
| 0.505000000000001 | 0.75 | 1.25 | 3.5 |
| 0.506000000000001 | 0.75 | 1.25 | 3.5 |
| 0.507000000000001 | 0.75 | 1.25 | 3.5 |
| 0.508000000000001 | 0.75 | 1.25 | 3.5 |
| 0.509000000000001 | 0.75 | 1.25 | 3.5 |
| 0.510000000000001 | 0.75 | 1.25 | 3.5 |
| 0.511000000000001 | 0.75 | 1.25 | 3.5 |
| 0.512000000000001 | 0.75 | 1.25 | 3.5 |
| 0.513000000000001 | 0.75 | 1.25 | 3.5 |
| 0.514000000000001 | 0.75 | 1.25 | 3.5 |
| 0.515000000000001 | 0.75 | 1.25 | 3.5 |
| 0.516000000000001 | 0.75 | 1.25 | 3.5 |
| 0.517000000000001 | 0.75 | 1.25 | 3.5 |
| 0.518000000000001 | 0.75 | 1.25 | 3.5 |
| 0.519000000000001 | 0.75 | 1.25 | 3.5 |
| 0.520000000000001 | 0.75 | 1.25 | 3.5 |
| 0.521000000000001 | 0.75 | 1.25 | 3.5 |
| 0.522000000000001 | 0.75 | 1.25 | 3.5 |
| 0.523000000000001 | 0.75 | 1.25 | 3.5 |
| 0.524000000000001 | 0.75 | 1.25 | 3.5 |
| 0.525000000000001 | 0.75 | 1.25 | 3.5 |
| 0.526000000000001 | 0.75 | 1.25 | 3.5 |
| 0.527000000000001 | 0.75 | 1.25 | 3.5 |
| 0.528000000000001 | 0.75 | 1.25 | 3.5 |
| 0.529000000000001 | 0.75 | 1.25 | 3.5 |
| 0.530000000000001 | 0.75 | 1.25 | 3.5 |
| 0.531000000000001 | 0.75 | 1.25 | 3.5 |
| 0.532000000000001 | 0.75 | 1.25 | 3.5 |
| 0.533000000000001 | 0.75 | 1.25 | 3.5 |
| 0.534000000000001 | 0.75 | 1.25 | 3.5 |
| 0.535000000000001 | 0.75 | 1.25 | 3.5 |
| 0.536000000000001 | 0.75 | 1.25 | 3.5 |
| 0.537000000000001 | 0.75 | 1.25 | 3.5 |
| 0.538000000000001 | 0.75 | 1.25 | 3.5 |
| 0.539000000000001 | 0.75 | 1.25 | 3.5 |
| 0.540000000000001 | 0.75 | 1.25 | 3.5 |
| 0.541000000000001 | 0.75 | 1.25 | 3.5 |
| 0.542000000000001 | 0.75 | 1.25 | 3.5 |
| 0.543000000000001 | 0.75 | 1.25 | 3.5 |
| 0.544000000000001 | 0.75 | 1.25 | 3.5 |
| 0.545000000000001 | 0.75 | 1.25 | 3.5 |
| 0.546000000000001 | 0.75 | 1.25 | 3.5 |
| 0.547000000000001 | 0.75 | 1.25 | 3.5 |
| 0.548000000000001 | 0.75 | 1.25 | 3.5 |
| 0.549000000000001 | 0.75 | 1.25 | 3.5 |
| 0.550000000000001 | 0.75 | 1.25 | 3.5 |
| 0.551000000000001 | 0.75 | 1.25 | 3.5 |
| 0.552000000000001 | 0.75 | 1.25 | 3.5 |
| 0.553000000000001 | 0.75 | 1.25 | 3.5 |
| 0.554000000000001 | 0.75 | 1.25 | 3.5 |
| 0.555000000000001 | 0.75 | 1.25 | 3.5 |
| 0.556000000000001 | 0.75 | 1.25 | 3.5 |
| 0.557000000000001 | 0.75 | 1.25 | 3.5 |
| 0.558000000000001 | 0.75 | 1.25 | 3.5 |
| 0.559000000000001 | 0.75 | 1.25 | 3.5 |
| 0.560000000000001 | 0.75 | 1.25 | 3.5 |
| 0.561000000000001 | 0.75 | 1.25 | 3.5 |
| 0.562000000000001 | 0.75 | 1.25 | 3.5 |
| 0.563000000000001 | 0.75 | 1.25 | 3.5 |
| 0.564000000000001 | 0.75 | 1.25 | 3.5 |
| 0.565000000000001 | 0.75 | 1.25 | 3.5 |
| 0.566000000000001 | 0.75 | 1.25 | 3.5 |
| 0.567000000000001 | 0.75 | 1.25 | 3.5 |
| 0.568000000000001 | 0.75 | 1.25 | 3.5 |
| 0.569000000000001 | 0.75 | 1.25 | 3.5 |
| 0.570000000000001 | 0.75 | 1.25 | 3.5 |
| 0.571000000000001 | 0.75 | 1.25 | 3.5 |
| 0.572000000000001 | 0.75 | 1.25 | 3.5 |
| 0.573000000000001 | 0.75 | 1.25 | 3.5 |
| 0.574000000000001 | 0.75 | 1.25 | 3.5 |
| 0.575000000000001 | 0.75 | 1.25 | 3.5 |
| 0.576000000000001 | 0.75 | 1.25 | 3.5 |
| 0.577000000000001 | 0.75 | 1.25 | 3.5 |
| 0.578000000000001 | 0.75 | 1.25 | 3.5 |
| 0.579000000000001 | 0.75 | 1.25 | 3.5 |
| 0.580000000000001 | 0.75 | 1.25 | 3.5 |
| 0.581000000000001 | 0.75 | 1.25 | 3.5 |
| 0.582000000000001 | 0.75 | 1.25 | 3.5 |
| 0.583000000000001 | 0.75 | 1.25 | 3.5 |
| 0.584000000000001 | 0.75 | 1.25 | 3.5 |
| 0.585000000000001 | 0.75 | 1.25 | 3.5 |
| 0.586000000000001 | 0.75 | 1.25 | 3.5 |
| 0.587000000000001 | 0.75 | 1.25 | 3.5 |
| 0.588000000000001 | 0.75 | 1.25 | 3.5 |
| 0.589000000000001 | 0.75 | 1.25 | 3.5 |
| 0.590000000000001 | 0.75 | 1.25 | 3.5 |
| 0.591000000000001 | 0.75 | 1.25 | 3.5 |
| 0.592000000000001 | 0.75 | 1.25 | 3.5 |
| 0.593000000000001 | 0.75 | 1.25 | 3.5 |
| 0.594000000000001 | 0.75 | 1.25 | 3.5 |
| 0.595000000000001 | 0.75 | 1.25 | 3.5 |
| 0.596000000000001 | 0.75 | 1.25 | 3.5 |
| 0.597000000000001 | 0.75 | 1.25 | 3.5 |
| 0.598000000000001 | 0.75 | 1.25 | 3.5 |
| 0.599000000000001 | 0.75 | 1.25 | 3.5 |
| 0.600000000000001 | 0.75 | 1.25 | 3.5 |
| 0.601000000000001 | 0.75 | 1.25 | 3.5 |
| 0.602000000000001 | 0.75 | 1.25 | 3.5 |
| 0.603000000000001 | 0.75 | 1.25 | 3.5 |
| 0.604000000000001 | 0.75 | 1.25 | 3.5 |
| 0.605000000000001 | 0.75 | 1.25 | 3.5 |
| 0.606000000000001 | 0.75 | 1.25 | 3.5 |
| 0.607000000000001 | 0.75 | 1.25 | 3.5 |
| 0.608000000000001 | 0.75 | 1.25 | 3.5 |
| 0.609000000000001 | 0.75 | 1.25 | 3.5 |
| 0.610000000000001 | 0.75 | 1.25 | 3.5 |
| 0.611000000000001 | 0.75 | 1.25 | 3.5 |
| 0.612000000000001 | 0.75 | 1.25 | 3.5 |
| 0.613000000000001 | 0.75 | 1.25 | 3.5 |
| 0.614000000000001 | 0.75 | 1.25 | 3.5 |
| 0.615000000000001 | 0.75 | 1.25 | 3.5 |
| 0.616000000000001 | 0.75 | 1.25 | 3.5 |
| 0.617000000000001 | 0.75 | 1.25 | 3.5 |
| 0.618000000000001 | 0.75 | 1.25 | 3.5 |
| 0.619000000000001 | 0.75 | 1.25 | 3.5 |
| 0.620000000000001 | 0.75 | 1.25 | 3.5 |
| 0.621000000000001 | 0.75 | 1.25 | 3.5 |
| 0.622000000000001 | 0.75 | 1.25 | 3.5 |
| 0.623000000000001 | 0.75 | 1.25 | 3.5 |
| 0.624000000000001 | 0.75 | 1.25 | 3.5 |
| 0.625000000000001 | 0.75 | 1.25 | 3.5 |
| 0.626000000000001 | 0.75 | 1.25 | 3.5 |
| 0.627000000000001 | 0.75 | 1.25 | 3.5 |
| 0.628000000000001 | 0.75 | 1.25 | 3.5 |
| 0.629000000000001 | 0.75 | 1.25 | 3.5 |
| 0.630000000000001 | 0.75 | 1.25 | 3.5 |
| 0.631000000000001 | 0.75 | 1.25 | 3.5 |
| 0.632000000000001 | 0.75 | 1.25 | 3.5 |
| 0.633000000000001 | 0.75 | 1.25 | 3.5 |
| 0.634000000000001 | 0.75 | 1.25 | 3.5 |
| 0.635000000000001 | 0.75 | 1.25 | 3.5 |
| 0.636000000000001 | 0.75 | 1.25 | 3.5 |
| 0.637000000000001 | 0.75 | 1.25 | 3.5 |
| 0.638000000000001 | 0.75 | 1.25 | 3.5 |
| 0.639000000000001 | 0.75 | 1.25 | 3.5 |
| 0.640000000000001 | 0.75 | 1.25 | 3.5 |
| 0.641000000000001 | 0.75 | 1.25 | 3.5 |
| 0.642000000000001 | 0.75 | 1.25 | 3.5 |
| 0.643000000000001 | 0.75 | 1.25 | 3.5 |
| 0.644000000000001 | 0.75 | 1.25 | 3.5 |
| 0.645000000000001 | 0.75 | 1.25 | 3.5 |
| 0.646000000000001 | 0.75 | 1.25 | 3.5 |
| 0.647000000000001 | 0.75 | 1.25 | 3.5 |
| 0.648000000000001 | 0.75 | 1.25 | 3.5 |
| 0.649000000000001 | 0.75 | 1.25 | 3.5 |
| 0.650000000000001 | 0.75 | 1.25 | 3.5 |
| 0.651000000000001 | 0.75 | 1.25 | 3.5 |
| 0.652000000000001 | 0.75 | 1.25 | 3.5 |
| 0.653000000000001 | 0.75 | 1.25 | 3.5 |
| 0.654000000000001 | 0.75 | 1.25 | 3.5 |
| 0.655000000000001 | 0.75 | 1.25 | 3.5 |
| 0.656000000000001 | 0.75 | 1.25 | 3.5 |
| 0.657000000000001 | 0.75 | 1.25 | 3.5 |
| 0.658000000000001 | 0.75 | 1.25 | 3.5 |
| 0.659000000000001 | 0.75 | 1.25 | 3.5 |
| 0.660000000000001 | 0.75 | 1.25 | 3.5 |
| 0.661000000000001 | 0.75 | 1.25 | 3.5 |
| 0.662000000000001 | 0.75 | 1.25 | 3.5 |
| 0.663000000000001 | 0.75 | 1.25 | 3.5 |
| 0.664000000000001 | 0.75 | 1.25 | 3.5 |
| 0.665000000000001 | 0.75 | 1.25 | 3.5 |
| 0.666000000000001 | 0.75 | 1.25 | 3.5 |
| 0.667000000000001 | 0.75 | 1.25 | 3.5 |
| 0.668000000000001 | 0.75 | 1.25 | 3.5 |
| 0.669000000000001 | 0.75 | 1.25 | 3.5 |
| 0.670000000000001 | 0.75 | 1.25 | 3.5 |
| 0.671000000000001 | 0.75 | 1.25 | 3.5 |
| 0.672000000000001 | 0.75 | 1.25 | 3.5 |
| 0.673000000000001 | 0.75 | 1.25 | 3.5 |
| 0.674000000000001 | 0.75 | 1.25 | 3.5 |
| 0.675000000000001 | 0.75 | 1.25 | 3.5 |
| 0.676000000000001 | 0.75 | 1.25 | 3.5 |
| 0.677000000000001 | 0.75 | 1.25 | 3.5 |
| 0.678000000000001 | 0.75 | 1.25 | 3.5 |
| 0.679000000000001 | 0.75 | 1.25 | 3.5 |
| 0.680000000000001 | 0.75 | 1.25 | 3.5 |
| 0.681000000000001 | 0.75 | 1.25 | 3.5 |
| 0.682000000000001 | 0.75 | 1.25 | 3.5 |
| 0.683000000000001 | 0.75 | 1.25 | 3.5 |
| 0.684000000000001 | 0.75 | 1.25 | 3.5 |
| 0.685000000000001 | 0.75 | 1.25 | 3.5 |
| 0.686000000000001 | 0.75 | 1.25 | 3.5 |
| 0.687000000000001 | 0.75 | 1.25 | 3.5 |
| 0.688000000000001 | 0.75 | 1.25 | 3.5 |
| 0.689000000000001 | 0.75 | 1.25 | 3.5 |
| 0.690000000000001 | 0.75 | 1.25 | 3.5 |
| 0.691000000000001 | 0.75 | 1.25 | 3.5 |
| 0.692000000000001 | 0.75 | 1.25 | 3.5 |
| 0.693000000000001 | 0.75 | 1.25 | 3.5 |
| 0.694000000000001 | 0.75 | 1.25 | 3.5 |
| 0.695000000000001 | 0.75 | 1.25 | 3.5 |
| 0.696000000000001 | 0.75 | 1.25 | 3.5 |
| 0.697000000000001 | 0.75 | 1.25 | 3.5 |
| 0.698000000000001 | 0.75 | 1.25 | 3.5 |
| 0.699000000000001 | 0.75 | 1.25 | 3.5 |
| 0.700000000000001 | 0.75 | 1.25 | 3.5 |
| 0.701000000000001 | 0.75 | 1.25 | 3.5 |
| 0.702000000000001 | 0.75 | 1.25 | 3.5 |
| 0.703000000000001 | 0.75 | 1.25 | 3.5 |
| 0.704000000000001 | 0.75 | 1.25 | 3.5 |
| 0.705000000000001 | 0.75 | 1.25 | 3.5 |
| 0.706000000000001 | 0.75 | 1.25 | 3.5 |
| 0.707000000000001 | 0.75 | 1.25 | 3.5 |
| 0.708000000000001 | 0.75 | 1.25 | 3.5 |
| 0.709000000000001 | 0.75 | 1.25 | 3.5 |
| 0.710000000000001 | 0.75 | 1.25 | 3.5 |
| 0.711000000000001 | 0.75 | 1.25 | 3.5 |
| 0.712000000000001 | 0.75 | 1.25 | 3.5 |
| 0.713000000000001 | 0.75 | 1.25 | 3.5 |
| 0.714000000000001 | 0.75 | 1.25 | 3.5 |
| 0.715000000000001 | 0.75 | 1.25 | 3.5 |
| 0.716000000000001 | 0.75 | 1.25 | 3.5 |
| 0.717000000000001 | 0.75 | 1.25 | 3.5 |
| 0.718000000000001 | 0.75 | 1.25 | 3.5 |
| 0.719000000000001 | 0.75 | 1.25 | 3.5 |
| 0.720000000000001 | 0.75 | 1.25 | 3.5 |
| 0.721000000000001 | 0.75 | 1.25 | 3.5 |
| 0.722000000000001 | 0.75 | 1.25 | 3.5 |
| 0.723000000000001 | 0.75 | 1.25 | 3.5 |
| 0.724000000000001 | 0.75 | 1.25 | 3.5 |
| 0.725000000000001 | 0.75 | 1.25 | 3.5 |
| 0.726000000000001 | 0.75 | 1.25 | 3.5 |
| 0.727000000000001 | 0.75 | 1.25 | 3.5 |
| 0.728000000000001 | 0.75 | 1.25 | 3.5 |
| 0.729000000000001 | 0.75 | 1.25 | 3.5 |
| 0.730000000000001 | 0.75 | 1.25 | 3.5 |
| 0.731000000000001 | 0.75 | 1.25 | 3.5 |
| 0.732000000000001 | 0.75 | 1.25 | 3.5 |
| 0.733000000000001 | 0.75 | 1.25 | 3.5 |
| 0.734000000000001 | 0.75 | 1.25 | 3.5 |
| 0.735000000000001 | 0.75 | 1.25 | 3.5 |
| 0.736000000000001 | 0.75 | 1.25 | 3.5 |
| 0.737000000000001 | 0.75 | 1.25 | 3.5 |
| 0.738000000000001 | 0.75 | 1.25 | 3.5 |
| 0.739000000000001 | 0.75 | 1.25 | 3.5 |
| 0.740000000000001 | 0.75 | 1.25 | 3.5 |
| 0.741000000000001 | 0.75 | 1.25 | 3.5 |
| 0.742000000000001 | 0.75 | 1.25 | 3.5 |
| 0.743000000000001 | 0.75 | 1.25 | 3.5 |
| 0.744000000000001 | 0.75 | 1.25 | 3.5 |
| 0.745000000000001 | 0.75 | 1.25 | 3.5 |
| 0.746000000000001 | 0.75 | 1.25 | 3.5 |
| 0.747000000000001 | 0.75 | 1.25 | 3.5 |
| 0.748000000000001 | 0.75 | 1.25 | 3.5 |
| 0.749000000000001 | 0.75 | 1.25 | 3.5 |
| 0.750000000000001 | 0.75 | 1.25 | 3.5 |
| 0.751000000000001 | 0.75 | 1.25 | 3.5 |
| 0.752000000000001 | 0.75 | 1.25 | 3.5 |
| 0.753000000000001 | 0.75 | 1.25 | 3.5 |
| 0.754000000000001 | 0.75 | 1.25 | 3.5 |
| 0.755000000000001 | 0.75 | 1.25 | 3.5 |
| 0.756000000000001 | 0.75 | 1.25 | 3.5 |
| 0.757000000000001 | 0.75 | 1.25 | 3.5 |
| 0.758000000000001 | 0.75 | 1.25 | 3.5 |
| 0.759000000000001 | 0.75 | 1.25 | 3.5 |
| 0.760000000000001 | 0.75 | 1.25 | 3.5 |
| 0.761000000000001 | 0.75 | 1.25 | 3.5 |
| 0.762000000000001 | 0.75 | 1.25 | 3.5 |
| 0.763000000000001 | 0.75 | 1.25 | 3.5 |
| 0.764000000000001 | 0.75 | 1.25 | 3.5 |
| 0.765000000000001 | 0.75 | 1.25 | 3.5 |
| 0.766000000000001 | 0.75 | 1.25 | 3.5 |
| 0.767000000000001 | 0.75 | 1.25 | 3.5 |
| 0.768000000000001 | 0.75 | 1.25 | 3.5 |
| 0.769000000000001 | 0.75 | 1.25 | 3.5 |
| 0.770000000000001 | 0.75 | 1.25 | 3.5 |
| 0.771000000000001 | 0.75 | 1.25 | 3.5 |
| 0.772000000000001 | 0.75 | 1.25 | 3.5 |
| 0.773000000000001 | 0.75 | 1.25 | 3.5 |
| 0.774000000000001 | 0.75 | 1.25 | 3.5 |
| 0.775000000000001 | 0.75 | 1.25 | 3.5 |
| 0.776000000000001 | 0.75 | 1.25 | 3.5 |
| 0.777000000000001 | 0.75 | 1.25 | 3.5 |
| 0.778000000000001 | 0.75 | 1.25 | 3.5 |
| 0.779000000000001 | 0.75 | 1.25 | 3.5 |
| 0.780000000000001 | 0.75 | 1.25 | 3.5 |
| 0.781000000000001 | 0.75 | 1.25 | 3.5 |
| 0.782000000000001 | 0.75 | 1.25 | 3.5 |
| 0.783000000000001 | 0.75 | 1.25 | 3.5 |
| 0.784000000000001 | 0.75 | 1.25 | 3.5 |
| 0.785000000000001 | 0.75 | 1.25 | 3.5 |
| 0.786000000000001 | 0.75 | 1.25 | 3.5 |
| 0.787000000000001 | 0.75 | 1.25 | 3.5 |
| 0.788000000000001 | 0.75 | 1.25 | 3.5 |
| 0.789000000000001 | 0.75 | 1.25 | 3.5 |
| 0.790000000000001 | 0.75 | 1.25 | 3.5 |
| 0.791000000000001 | 0.75 | 1.25 | 3.5 |
| 0.792000000000001 | 0.75 | 1.25 | 3.5 |
| 0.793000000000001 | 0.75 | 1.25 | 3.5 |
| 0.794000000000001 | 0.75 | 1.25 | 3.5 |
| 0.795000000000001 | 0.75 | 1.25 | 3.5 |
| 0.796000000000001 | 0.75 | 1.25 | 3.5 |
| 0.797000000000001 | 0.75 | 1.25 | 3.5 |
| 0.798000000000001 | 0.75 | 1.25 | 3.5 |
| 0.799000000000001 | 0.75 | 1.25 | 3.5 |
| 0.800000000000001 | 0.75 | 1.25 | 3.5 |
| 0.801000000000001 | 0.75 | 1.25 | 3.5 |
| 0.802000000000001 | 0.75 | 1.25 | 3.5 |
| 0.803000000000001 | 0.75 | 1.25 | 3.5 |
| 0.804000000000001 | 0.75 | 1.25 | 3.5 |
| 0.805000000000001 | 0.75 | 1.25 | 3.5 |
| 0.806000000000001 | 0.75 | 1.25 | 3.5 |
| 0.807000000000001 | 0.75 | 1.25 | 3.5 |
| 0.808000000000001 | 0.75 | 1.25 | 3.5 |
| 0.809000000000001 | 0.75 | 1.25 | 3.5 |
| 0.810000000000001 | 0.75 | 1.25 | 3.5 |
| 0.811000000000001 | 0.75 | 1.25 | 3.5 |
| 0.812000000000001 | 0.75 | 1.25 | 3.5 |
| 0.813000000000001 | 0.75 | 1.25 | 3.5 |
| 0.814000000000001 | 0.75 | 1.25 | 3.5 |
| 0.815000000000001 | 0.75 | 1.25 | 3.5 |
| 0.816000000000001 | 0.75 | 1.25 | 3.5 |
| 0.817000000000001 | 0.75 | 1.25 | 3.5 |
| 0.818000000000001 | 0.75 | 1.25 | 3.5 |
| 0.819000000000001 | 0.75 | 1.25 | 3.5 |
| 0.820000000000001 | 0.75 | 1.25 | 3.5 |
| 0.821000000000001 | 0.75 | 1.25 | 3.5 |
| 0.822000000000001 | 0.75 | 1.25 | 3.5 |
| 0.823000000000001 | 0.75 | 1.25 | 3.5 |
| 0.824000000000001 | 0.75 | 1.25 | 3.5 |
| 0.825000000000001 | 0.75 | 1.25 | 3.5 |
| 0.826000000000001 | 0.75 | 1.25 | 3.5 |
| 0.827000000000001 | 0.75 | 1.25 | 3.5 |
| 0.828000000000001 | 0.75 | 1.25 | 3.5 |
| 0.829000000000001 | 0.75 | 1.25 | 3.5 |
| 0.830000000000001 | 0.75 | 1.25 | 3.5 |
| 0.831000000000001 | 0.75 | 1.25 | 3.5 |
| 0.832000000000001 | 0.75 | 1.25 | 3.5 |
| 0.833000000000001 | 0.75 | 1.25 | 3.5 |
| 0.834000000000001 | 0.75 | 1.25 | 3.5 |
| 0.835000000000001 | 0.75 | 1.25 | 3.5 |
| 0.836000000000001 | 0.75 | 1.25 | 3.5 |
| 0.837000000000001 | 0.75 | 1.25 | 3.5 |
| 0.838000000000001 | 0.75 | 1.25 | 3.5 |
| 0.839000000000001 | 0.75 | 1.25 | 3.5 |
| 0.840000000000001 | 0.75 | 1.25 | 3.5 |
| 0.841000000000001 | 0.75 | 1.25 | 3.5 |
| 0.842000000000001 | 0.75 | 1.25 | 3.5 |
| 0.843000000000001 | 0.75 | 1.25 | 3.5 |
| 0.844000000000001 | 0.75 | 1.25 | 3.5 |
| 0.845000000000001 | 0.75 | 1.25 | 3.5 |
| 0.846000000000001 | 0.75 | 1.25 | 3.5 |
| 0.847000000000001 | 0.75 | 1.25 | 3.5 |
| 0.848000000000001 | 0.75 | 1.25 | 3.5 |
| 0.849000000000001 | 0.75 | 1.25 | 3.5 |
| 0.850000000000001 | 0.75 | 1.25 | 3.5 |
| 0.851000000000001 | 0.75 | 1.25 | 3.5 |
| 0.852000000000001 | 0.75 | 1.25 | 3.5 |
| 0.853000000000001 | 0.75 | 1.25 | 3.5 |
| 0.854000000000001 | 0.75 | 1.25 | 3.5 |
| 0.855000000000001 | 0.75 | 1.25 | 3.5 |
| 0.856000000000001 | 0.75 | 1.25 | 3.5 |
| 0.857000000000001 | 0.75 | 1.25 | 3.5 |
| 0.858000000000001 | 0.75 | 1.25 | 3.5 |
| 0.859000000000001 | 0.75 | 1.25 | 3.5 |
| 0.860000000000001 | 0.75 | 1.25 | 3.5 |
| 0.861000000000001 | 0.75 | 1.25 | 3.5 |
| 0.862000000000001 | 0.75 | 1.25 | 3.5 |
| 0.863000000000001 | 0.75 | 1.25 | 3.5 |
| 0.864000000000001 | 0.75 | 1.25 | 3.5 |
| 0.865000000000001 | 0.75 | 1.25 | 3.5 |
| 0.866000000000001 | 0.75 | 1.25 | 3.5 |
| 0.867000000000001 | 0.75 | 1.25 | 3.5 |
| 0.868000000000001 | 0.75 | 1.25 | 3.5 |
| 0.869000000000001 | 0.75 | 1.25 | 3.5 |
| 0.870000000000001 | 0.75 | 1.25 | 3.5 |
| 0.871000000000001 | 0.75 | 1.25 | 3.5 |
| 0.872000000000002 | 0.75 | 1.25 | 3.5 |
| 0.873000000000002 | 0.75 | 1.25 | 3.5 |
| 0.874000000000002 | 0.75 | 1.25 | 3.5 |
| 0.875000000000002 | 0.75 | 1.25 | 3.5 |
| 0.876000000000002 | 0.75 | 1.25 | 3.5 |
| 0.877000000000002 | 0.75 | 1.25 | 3.5 |
| 0.878000000000002 | 0.75 | 1.25 | 3.5 |
| 0.879000000000002 | 0.75 | 1.25 | 3.5 |
| 0.880000000000001 | 0.75 | 1.25 | 3.5 |
| 0.881000000000001 | 0.75 | 1.25 | 3.5 |
| 0.882000000000002 | 0.75 | 1.25 | 3.5 |
| 0.883000000000002 | 0.75 | 1.25 | 3.5 |
| 0.884000000000002 | 0.75 | 1.25 | 3.5 |
| 0.885000000000002 | 0.75 | 1.25 | 3.5 |
| 0.886000000000002 | 0.75 | 1.25 | 3.5 |
| 0.887000000000002 | 0.75 | 1.25 | 3.5 |
| 0.888000000000002 | 0.75 | 1.25 | 3.5 |
| 0.889000000000002 | 0.75 | 1.25 | 3.5 |
| 0.890000000000001 | 0.75 | 1.25 | 3.5 |
| 0.891000000000001 | 0.75 | 1.25 | 3.5 |
| 0.892000000000002 | 0.75 | 1.25 | 3.5 |
| 0.893000000000002 | 0.75 | 1.25 | 3.5 |
| 0.894000000000002 | 0.75 | 1.25 | 3.5 |
| 0.895000000000002 | 0.75 | 1.25 | 3.5 |
| 0.896000000000002 | 0.75 | 1.25 | 3.5 |
| 0.897000000000002 | 0.75 | 1.25 | 3.5 |
| 0.898000000000002 | 0.75 | 1.25 | 3.5 |
| 0.899000000000002 | 0.75 | 1.25 | 3.5 |
| 0.900000000000002 | 0.75 | 1.25 | 3.5 |
| 0.901000000000002 | 0.75 | 1.25 | 3.5 |
| 0.902000000000002 | 0.75 | 1.25 | 3.5 |
| 0.903000000000002 | 0.75 | 1.25 | 3.5 |
| 0.904000000000002 | 0.75 | 1.25 | 3.5 |
| 0.905000000000002 | 0.75 | 1.25 | 3.5 |
| 0.906000000000002 | 0.75 | 1.25 | 3.5 |
| 0.907000000000002 | 0.75 | 1.25 | 3.5 |
| 0.908000000000002 | 0.75 | 1.25 | 3.5 |
| 0.909000000000002 | 0.75 | 1.25 | 3.5 |
| 0.910000000000002 | 0.75 | 1.25 | 3.5 |
| 0.911000000000002 | 0.75 | 1.25 | 3.5 |
| 0.912000000000002 | 0.75 | 1.25 | 3.5 |
| 0.913000000000002 | 0.75 | 1.25 | 3.5 |
| 0.914000000000002 | 0.75 | 1.25 | 3.5 |
| 0.915000000000002 | 0.75 | 1.25 | 3.5 |
| 0.916000000000002 | 0.75 | 1.25 | 3.5 |
| 0.917000000000002 | 0.75 | 1.25 | 3.5 |
| 0.918000000000002 | 0.75 | 1.25 | 3.5 |
| 0.919000000000002 | 0.75 | 1.25 | 3.5 |
| 0.920000000000002 | 0.75 | 1.25 | 3.5 |
| 0.921000000000002 | 0.75 | 1.25 | 3.5 |
| 0.922000000000002 | 0.75 | 1.25 | 3.5 |
| 0.923000000000002 | 0.75 | 1.25 | 3.5 |
| 0.924000000000002 | 0.75 | 1.25 | 3.5 |
| 0.925000000000002 | 0.75 | 1.25 | 3.5 |
| 0.926000000000002 | 0.75 | 1.25 | 3.5 |
| 0.927000000000002 | 0.75 | 1.25 | 3.5 |
| 0.928000000000002 | 0.75 | 1.25 | 3.5 |
| 0.929000000000002 | 0.75 | 1.25 | 3.5 |
| 0.930000000000002 | 0.75 | 1.25 | 3.5 |
| 0.931000000000002 | 0.75 | 1.25 | 3.5 |
| 0.932000000000002 | 0.75 | 1.25 | 3.5 |
| 0.933000000000002 | 0.75 | 1.25 | 3.5 |
| 0.934000000000002 | 0.75 | 1.25 | 3.5 |
| 0.935000000000002 | 0.75 | 1.25 | 3.5 |
| 0.936000000000002 | 0.75 | 1.25 | 3.5 |
| 0.937000000000002 | 0.75 | 1.25 | 3.5 |
| 0.938000000000002 | 0.75 | 1.25 | 3.5 |
| 0.939000000000002 | 0.75 | 1.25 | 3.5 |
| 0.940000000000002 | 0.75 | 1.25 | 3.5 |
| 0.941000000000002 | 0.75 | 1.25 | 3.5 |
| 0.942000000000002 | 0.75 | 1.25 | 3.5 |
| 0.943000000000002 | 0.75 | 1.25 | 3.5 |
| 0.944000000000002 | 0.75 | 1.25 | 3.5 |
| 0.945000000000002 | 0.75 | 1.25 | 3.5 |
| 0.946000000000002 | 0.75 | 1.25 | 3.5 |
| 0.947000000000002 | 0.75 | 1.25 | 3.5 |
| 0.948000000000002 | 0.75 | 1.25 | 3.5 |
| 0.949000000000002 | 0.75 | 1.25 | 3.5 |
| 0.950000000000002 | 0.75 | 1.25 | 3.5 |
| 0.951000000000002 | 0.75 | 1.25 | 3.5 |
| 0.952000000000002 | 0.75 | 1.25 | 3.5 |
| 0.953000000000002 | 0.75 | 1.25 | 3.5 |
| 0.954000000000002 | 0.75 | 1.25 | 3.5 |
| 0.955000000000002 | 0.75 | 1.25 | 3.5 |
| 0.956000000000002 | 0.75 | 1.25 | 3.5 |
| 0.957000000000002 | 0.75 | 1.25 | 3.5 |
| 0.958000000000002 | 0.75 | 1.25 | 3.5 |
| 0.959000000000002 | 0.75 | 1.25 | 3.5 |
| 0.960000000000002 | 0.75 | 1.25 | 3.5 |
| 0.961000000000002 | 0.75 | 1.25 | 3.5 |
| 0.962000000000002 | 0.75 | 1.25 | 3.5 |
| 0.963000000000002 | 0.75 | 1.25 | 3.5 |
| 0.964000000000002 | 0.75 | 1.25 | 3.5 |
| 0.965000000000002 | 0.75 | 1.25 | 3.5 |
| 0.966000000000002 | 0.75 | 1.25 | 3.5 |
| 0.967000000000002 | 0.75 | 1.25 | 3.5 |
| 0.968000000000002 | 0.75 | 1.25 | 3.5 |
| 0.969000000000002 | 0.75 | 1.25 | 3.5 |
| 0.970000000000002 | 0.75 | 1.25 | 3.5 |
| 0.971000000000002 | 0.75 | 1.25 | 3.5 |
| 0.972000000000002 | 0.75 | 1.25 | 3.5 |
| 0.973000000000002 | 0.75 | 1.25 | 3.5 |
| 0.974000000000002 | 0.75 | 1.25 | 3.5 |
| 0.975000000000002 | 0.75 | 1.25 | 3.5 |
| 0.976000000000002 | 0.75 | 1.25 | 3.5 |
| 0.977000000000002 | 0.75 | 1.25 | 3.5 |
| 0.978000000000002 | 0.75 | 1.25 | 3.5 |
| 0.979000000000002 | 0.75 | 1.25 | 3.5 |
| 0.980000000000002 | 0.75 | 1.25 | 3.5 |
| 0.981000000000002 | 0.75 | 1.25 | 3.5 |
| 0.982000000000002 | 0.75 | 1.25 | 3.5 |
| 0.983000000000002 | 0.75 | 1.25 | 3.5 |
| 0.984000000000002 | 0.75 | 1.25 | 3.5 |
| 0.985000000000002 | 0.75 | 1.25 | 3.5 |
| 0.986000000000002 | 0.75 | 1.25 | 3.5 |
| 0.987000000000002 | 0.75 | 1.25 | 3.5 |
| 0.988000000000002 | 0.75 | 1.25 | 3.5 |
| 0.989000000000002 | 0.75 | 1.25 | 3.5 |
| 0.990000000000002 | 0.75 | 1.25 | 3.5 |
| 0.991000000000002 | 0.75 | 1.25 | 3.5 |
| 0.992000000000002 | 0.75 | 1.25 | 3.5 |
| 0.993000000000002 | 0.75 | 1.25 | 3.5 |
| 0.994000000000002 | 0.75 | 1.25 | 3.5 |
| 0.995000000000002 | 0.75 | 1.25 | 3.5 |
| 0.996000000000002 | 0.75 | 1.25 | 3.5 |
| 0.997000000000002 | 0.75 | 1.25 | 3.5 |
| 0.998000000000002 | 0.75 | 1.25 | 3.5 |
| 0.999000000000002 | 0.75 | 1.25 | 3.5 |
| 1.000000000000002 | 0.75 | 1.25 | 3.5 |